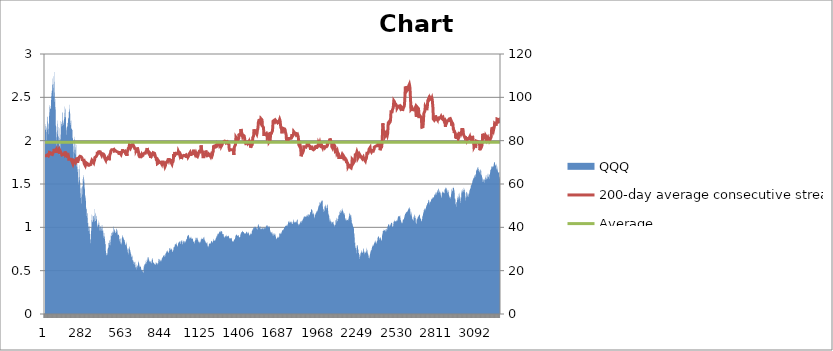
| Category | 200-day average consecutive streak | Average |
|---|---|---|
| 0 | 1.825 | 1.981 |
| 1 | 1.825 | 1.981 |
| 2 | 1.825 | 1.981 |
| 3 | 1.83 | 1.981 |
| 4 | 1.825 | 1.981 |
| 5 | 1.825 | 1.981 |
| 6 | 1.83 | 1.981 |
| 7 | 1.83 | 1.981 |
| 8 | 1.825 | 1.981 |
| 9 | 1.82 | 1.981 |
| 10 | 1.83 | 1.981 |
| 11 | 1.825 | 1.981 |
| 12 | 1.83 | 1.981 |
| 13 | 1.83 | 1.981 |
| 14 | 1.835 | 1.981 |
| 15 | 1.83 | 1.981 |
| 16 | 1.835 | 1.981 |
| 17 | 1.84 | 1.981 |
| 18 | 1.845 | 1.981 |
| 19 | 1.845 | 1.981 |
| 20 | 1.845 | 1.981 |
| 21 | 1.84 | 1.981 |
| 22 | 1.84 | 1.981 |
| 23 | 1.835 | 1.981 |
| 24 | 1.825 | 1.981 |
| 25 | 1.825 | 1.981 |
| 26 | 1.825 | 1.981 |
| 27 | 1.825 | 1.981 |
| 28 | 1.835 | 1.981 |
| 29 | 1.845 | 1.981 |
| 30 | 1.855 | 1.981 |
| 31 | 1.865 | 1.981 |
| 32 | 1.875 | 1.981 |
| 33 | 1.875 | 1.981 |
| 34 | 1.87 | 1.981 |
| 35 | 1.86 | 1.981 |
| 36 | 1.865 | 1.981 |
| 37 | 1.865 | 1.981 |
| 38 | 1.86 | 1.981 |
| 39 | 1.86 | 1.981 |
| 40 | 1.86 | 1.981 |
| 41 | 1.86 | 1.981 |
| 42 | 1.86 | 1.981 |
| 43 | 1.86 | 1.981 |
| 44 | 1.845 | 1.981 |
| 45 | 1.85 | 1.981 |
| 46 | 1.845 | 1.981 |
| 47 | 1.85 | 1.981 |
| 48 | 1.85 | 1.981 |
| 49 | 1.85 | 1.981 |
| 50 | 1.855 | 1.981 |
| 51 | 1.85 | 1.981 |
| 52 | 1.84 | 1.981 |
| 53 | 1.83 | 1.981 |
| 54 | 1.83 | 1.981 |
| 55 | 1.835 | 1.981 |
| 56 | 1.845 | 1.981 |
| 57 | 1.86 | 1.981 |
| 58 | 1.86 | 1.981 |
| 59 | 1.865 | 1.981 |
| 60 | 1.865 | 1.981 |
| 61 | 1.86 | 1.981 |
| 62 | 1.865 | 1.981 |
| 63 | 1.875 | 1.981 |
| 64 | 1.89 | 1.981 |
| 65 | 1.905 | 1.981 |
| 66 | 1.895 | 1.981 |
| 67 | 1.9 | 1.981 |
| 68 | 1.905 | 1.981 |
| 69 | 1.895 | 1.981 |
| 70 | 1.88 | 1.981 |
| 71 | 1.865 | 1.981 |
| 72 | 1.875 | 1.981 |
| 73 | 1.875 | 1.981 |
| 74 | 1.88 | 1.981 |
| 75 | 1.875 | 1.981 |
| 76 | 1.88 | 1.981 |
| 77 | 1.885 | 1.981 |
| 78 | 1.89 | 1.981 |
| 79 | 1.895 | 1.981 |
| 80 | 1.875 | 1.981 |
| 81 | 1.88 | 1.981 |
| 82 | 1.88 | 1.981 |
| 83 | 1.88 | 1.981 |
| 84 | 1.88 | 1.981 |
| 85 | 1.88 | 1.981 |
| 86 | 1.875 | 1.981 |
| 87 | 1.875 | 1.981 |
| 88 | 1.875 | 1.981 |
| 89 | 1.875 | 1.981 |
| 90 | 1.875 | 1.981 |
| 91 | 1.875 | 1.981 |
| 92 | 1.875 | 1.981 |
| 93 | 1.88 | 1.981 |
| 94 | 1.88 | 1.981 |
| 95 | 1.885 | 1.981 |
| 96 | 1.895 | 1.981 |
| 97 | 1.89 | 1.981 |
| 98 | 1.89 | 1.981 |
| 99 | 1.885 | 1.981 |
| 100 | 1.88 | 1.981 |
| 101 | 1.865 | 1.981 |
| 102 | 1.85 | 1.981 |
| 103 | 1.86 | 1.981 |
| 104 | 1.875 | 1.981 |
| 105 | 1.89 | 1.981 |
| 106 | 1.88 | 1.981 |
| 107 | 1.88 | 1.981 |
| 108 | 1.885 | 1.981 |
| 109 | 1.885 | 1.981 |
| 110 | 1.88 | 1.981 |
| 111 | 1.87 | 1.981 |
| 112 | 1.875 | 1.981 |
| 113 | 1.88 | 1.981 |
| 114 | 1.88 | 1.981 |
| 115 | 1.875 | 1.981 |
| 116 | 1.865 | 1.981 |
| 117 | 1.85 | 1.981 |
| 118 | 1.85 | 1.981 |
| 119 | 1.845 | 1.981 |
| 120 | 1.835 | 1.981 |
| 121 | 1.835 | 1.981 |
| 122 | 1.835 | 1.981 |
| 123 | 1.845 | 1.981 |
| 124 | 1.845 | 1.981 |
| 125 | 1.845 | 1.981 |
| 126 | 1.84 | 1.981 |
| 127 | 1.845 | 1.981 |
| 128 | 1.84 | 1.981 |
| 129 | 1.84 | 1.981 |
| 130 | 1.84 | 1.981 |
| 131 | 1.84 | 1.981 |
| 132 | 1.835 | 1.981 |
| 133 | 1.84 | 1.981 |
| 134 | 1.835 | 1.981 |
| 135 | 1.835 | 1.981 |
| 136 | 1.84 | 1.981 |
| 137 | 1.84 | 1.981 |
| 138 | 1.84 | 1.981 |
| 139 | 1.84 | 1.981 |
| 140 | 1.84 | 1.981 |
| 141 | 1.855 | 1.981 |
| 142 | 1.875 | 1.981 |
| 143 | 1.87 | 1.981 |
| 144 | 1.865 | 1.981 |
| 145 | 1.85 | 1.981 |
| 146 | 1.83 | 1.981 |
| 147 | 1.835 | 1.981 |
| 148 | 1.835 | 1.981 |
| 149 | 1.83 | 1.981 |
| 150 | 1.835 | 1.981 |
| 151 | 1.84 | 1.981 |
| 152 | 1.84 | 1.981 |
| 153 | 1.84 | 1.981 |
| 154 | 1.84 | 1.981 |
| 155 | 1.84 | 1.981 |
| 156 | 1.835 | 1.981 |
| 157 | 1.825 | 1.981 |
| 158 | 1.83 | 1.981 |
| 159 | 1.83 | 1.981 |
| 160 | 1.835 | 1.981 |
| 161 | 1.83 | 1.981 |
| 162 | 1.835 | 1.981 |
| 163 | 1.83 | 1.981 |
| 164 | 1.83 | 1.981 |
| 165 | 1.835 | 1.981 |
| 166 | 1.83 | 1.981 |
| 167 | 1.82 | 1.981 |
| 168 | 1.805 | 1.981 |
| 169 | 1.785 | 1.981 |
| 170 | 1.79 | 1.981 |
| 171 | 1.79 | 1.981 |
| 172 | 1.785 | 1.981 |
| 173 | 1.78 | 1.981 |
| 174 | 1.78 | 1.981 |
| 175 | 1.78 | 1.981 |
| 176 | 1.785 | 1.981 |
| 177 | 1.785 | 1.981 |
| 178 | 1.785 | 1.981 |
| 179 | 1.785 | 1.981 |
| 180 | 1.785 | 1.981 |
| 181 | 1.785 | 1.981 |
| 182 | 1.785 | 1.981 |
| 183 | 1.785 | 1.981 |
| 184 | 1.78 | 1.981 |
| 185 | 1.785 | 1.981 |
| 186 | 1.79 | 1.981 |
| 187 | 1.78 | 1.981 |
| 188 | 1.77 | 1.981 |
| 189 | 1.77 | 1.981 |
| 190 | 1.765 | 1.981 |
| 191 | 1.765 | 1.981 |
| 192 | 1.765 | 1.981 |
| 193 | 1.755 | 1.981 |
| 194 | 1.76 | 1.981 |
| 195 | 1.76 | 1.981 |
| 196 | 1.76 | 1.981 |
| 197 | 1.76 | 1.981 |
| 198 | 1.745 | 1.981 |
| 199 | 1.73 | 1.981 |
| 200 | 1.73 | 1.981 |
| 201 | 1.735 | 1.981 |
| 202 | 1.745 | 1.981 |
| 203 | 1.755 | 1.981 |
| 204 | 1.775 | 1.981 |
| 205 | 1.775 | 1.981 |
| 206 | 1.775 | 1.981 |
| 207 | 1.775 | 1.981 |
| 208 | 1.78 | 1.981 |
| 209 | 1.775 | 1.981 |
| 210 | 1.77 | 1.981 |
| 211 | 1.77 | 1.981 |
| 212 | 1.77 | 1.981 |
| 213 | 1.78 | 1.981 |
| 214 | 1.775 | 1.981 |
| 215 | 1.775 | 1.981 |
| 216 | 1.775 | 1.981 |
| 217 | 1.765 | 1.981 |
| 218 | 1.75 | 1.981 |
| 219 | 1.75 | 1.981 |
| 220 | 1.755 | 1.981 |
| 221 | 1.755 | 1.981 |
| 222 | 1.76 | 1.981 |
| 223 | 1.77 | 1.981 |
| 224 | 1.785 | 1.981 |
| 225 | 1.805 | 1.981 |
| 226 | 1.805 | 1.981 |
| 227 | 1.805 | 1.981 |
| 228 | 1.805 | 1.981 |
| 229 | 1.79 | 1.981 |
| 230 | 1.775 | 1.981 |
| 231 | 1.76 | 1.981 |
| 232 | 1.745 | 1.981 |
| 233 | 1.765 | 1.981 |
| 234 | 1.765 | 1.981 |
| 235 | 1.765 | 1.981 |
| 236 | 1.765 | 1.981 |
| 237 | 1.775 | 1.981 |
| 238 | 1.775 | 1.981 |
| 239 | 1.78 | 1.981 |
| 240 | 1.79 | 1.981 |
| 241 | 1.805 | 1.981 |
| 242 | 1.8 | 1.981 |
| 243 | 1.795 | 1.981 |
| 244 | 1.795 | 1.981 |
| 245 | 1.795 | 1.981 |
| 246 | 1.795 | 1.981 |
| 247 | 1.795 | 1.981 |
| 248 | 1.805 | 1.981 |
| 249 | 1.82 | 1.981 |
| 250 | 1.815 | 1.981 |
| 251 | 1.815 | 1.981 |
| 252 | 1.82 | 1.981 |
| 253 | 1.815 | 1.981 |
| 254 | 1.82 | 1.981 |
| 255 | 1.825 | 1.981 |
| 256 | 1.83 | 1.981 |
| 257 | 1.815 | 1.981 |
| 258 | 1.82 | 1.981 |
| 259 | 1.825 | 1.981 |
| 260 | 1.825 | 1.981 |
| 261 | 1.825 | 1.981 |
| 262 | 1.825 | 1.981 |
| 263 | 1.815 | 1.981 |
| 264 | 1.8 | 1.981 |
| 265 | 1.78 | 1.981 |
| 266 | 1.785 | 1.981 |
| 267 | 1.79 | 1.981 |
| 268 | 1.78 | 1.981 |
| 269 | 1.78 | 1.981 |
| 270 | 1.785 | 1.981 |
| 271 | 1.78 | 1.981 |
| 272 | 1.77 | 1.981 |
| 273 | 1.775 | 1.981 |
| 274 | 1.77 | 1.981 |
| 275 | 1.775 | 1.981 |
| 276 | 1.77 | 1.981 |
| 277 | 1.765 | 1.981 |
| 278 | 1.75 | 1.981 |
| 279 | 1.735 | 1.981 |
| 280 | 1.735 | 1.981 |
| 281 | 1.73 | 1.981 |
| 282 | 1.735 | 1.981 |
| 283 | 1.73 | 1.981 |
| 284 | 1.72 | 1.981 |
| 285 | 1.725 | 1.981 |
| 286 | 1.735 | 1.981 |
| 287 | 1.735 | 1.981 |
| 288 | 1.73 | 1.981 |
| 289 | 1.72 | 1.981 |
| 290 | 1.725 | 1.981 |
| 291 | 1.72 | 1.981 |
| 292 | 1.725 | 1.981 |
| 293 | 1.73 | 1.981 |
| 294 | 1.745 | 1.981 |
| 295 | 1.74 | 1.981 |
| 296 | 1.735 | 1.981 |
| 297 | 1.735 | 1.981 |
| 298 | 1.74 | 1.981 |
| 299 | 1.74 | 1.981 |
| 300 | 1.735 | 1.981 |
| 301 | 1.735 | 1.981 |
| 302 | 1.735 | 1.981 |
| 303 | 1.735 | 1.981 |
| 304 | 1.72 | 1.981 |
| 305 | 1.705 | 1.981 |
| 306 | 1.715 | 1.981 |
| 307 | 1.715 | 1.981 |
| 308 | 1.71 | 1.981 |
| 309 | 1.715 | 1.981 |
| 310 | 1.725 | 1.981 |
| 311 | 1.725 | 1.981 |
| 312 | 1.72 | 1.981 |
| 313 | 1.715 | 1.981 |
| 314 | 1.715 | 1.981 |
| 315 | 1.715 | 1.981 |
| 316 | 1.72 | 1.981 |
| 317 | 1.72 | 1.981 |
| 318 | 1.72 | 1.981 |
| 319 | 1.725 | 1.981 |
| 320 | 1.725 | 1.981 |
| 321 | 1.725 | 1.981 |
| 322 | 1.725 | 1.981 |
| 323 | 1.725 | 1.981 |
| 324 | 1.725 | 1.981 |
| 325 | 1.725 | 1.981 |
| 326 | 1.725 | 1.981 |
| 327 | 1.725 | 1.981 |
| 328 | 1.735 | 1.981 |
| 329 | 1.75 | 1.981 |
| 330 | 1.75 | 1.981 |
| 331 | 1.75 | 1.981 |
| 332 | 1.755 | 1.981 |
| 333 | 1.76 | 1.981 |
| 334 | 1.775 | 1.981 |
| 335 | 1.775 | 1.981 |
| 336 | 1.775 | 1.981 |
| 337 | 1.775 | 1.981 |
| 338 | 1.775 | 1.981 |
| 339 | 1.77 | 1.981 |
| 340 | 1.765 | 1.981 |
| 341 | 1.76 | 1.981 |
| 342 | 1.755 | 1.981 |
| 343 | 1.755 | 1.981 |
| 344 | 1.75 | 1.981 |
| 345 | 1.75 | 1.981 |
| 346 | 1.75 | 1.981 |
| 347 | 1.745 | 1.981 |
| 348 | 1.75 | 1.981 |
| 349 | 1.76 | 1.981 |
| 350 | 1.77 | 1.981 |
| 351 | 1.76 | 1.981 |
| 352 | 1.765 | 1.981 |
| 353 | 1.775 | 1.981 |
| 354 | 1.785 | 1.981 |
| 355 | 1.805 | 1.981 |
| 356 | 1.805 | 1.981 |
| 357 | 1.81 | 1.981 |
| 358 | 1.805 | 1.981 |
| 359 | 1.805 | 1.981 |
| 360 | 1.805 | 1.981 |
| 361 | 1.815 | 1.981 |
| 362 | 1.81 | 1.981 |
| 363 | 1.815 | 1.981 |
| 364 | 1.815 | 1.981 |
| 365 | 1.81 | 1.981 |
| 366 | 1.81 | 1.981 |
| 367 | 1.81 | 1.981 |
| 368 | 1.81 | 1.981 |
| 369 | 1.815 | 1.981 |
| 370 | 1.82 | 1.981 |
| 371 | 1.835 | 1.981 |
| 372 | 1.855 | 1.981 |
| 373 | 1.85 | 1.981 |
| 374 | 1.85 | 1.981 |
| 375 | 1.855 | 1.981 |
| 376 | 1.85 | 1.981 |
| 377 | 1.855 | 1.981 |
| 378 | 1.85 | 1.981 |
| 379 | 1.85 | 1.981 |
| 380 | 1.855 | 1.981 |
| 381 | 1.86 | 1.981 |
| 382 | 1.865 | 1.981 |
| 383 | 1.885 | 1.981 |
| 384 | 1.885 | 1.981 |
| 385 | 1.88 | 1.981 |
| 386 | 1.87 | 1.981 |
| 387 | 1.875 | 1.981 |
| 388 | 1.87 | 1.981 |
| 389 | 1.87 | 1.981 |
| 390 | 1.87 | 1.981 |
| 391 | 1.875 | 1.981 |
| 392 | 1.87 | 1.981 |
| 393 | 1.875 | 1.981 |
| 394 | 1.87 | 1.981 |
| 395 | 1.87 | 1.981 |
| 396 | 1.865 | 1.981 |
| 397 | 1.855 | 1.981 |
| 398 | 1.86 | 1.981 |
| 399 | 1.865 | 1.981 |
| 400 | 1.865 | 1.981 |
| 401 | 1.865 | 1.981 |
| 402 | 1.865 | 1.981 |
| 403 | 1.85 | 1.981 |
| 404 | 1.83 | 1.981 |
| 405 | 1.835 | 1.981 |
| 406 | 1.84 | 1.981 |
| 407 | 1.84 | 1.981 |
| 408 | 1.84 | 1.981 |
| 409 | 1.85 | 1.981 |
| 410 | 1.86 | 1.981 |
| 411 | 1.86 | 1.981 |
| 412 | 1.855 | 1.981 |
| 413 | 1.845 | 1.981 |
| 414 | 1.845 | 1.981 |
| 415 | 1.85 | 1.981 |
| 416 | 1.845 | 1.981 |
| 417 | 1.845 | 1.981 |
| 418 | 1.845 | 1.981 |
| 419 | 1.845 | 1.981 |
| 420 | 1.84 | 1.981 |
| 421 | 1.84 | 1.981 |
| 422 | 1.835 | 1.981 |
| 423 | 1.83 | 1.981 |
| 424 | 1.815 | 1.981 |
| 425 | 1.8 | 1.981 |
| 426 | 1.81 | 1.981 |
| 427 | 1.805 | 1.981 |
| 428 | 1.795 | 1.981 |
| 429 | 1.8 | 1.981 |
| 430 | 1.805 | 1.981 |
| 431 | 1.81 | 1.981 |
| 432 | 1.795 | 1.981 |
| 433 | 1.775 | 1.981 |
| 434 | 1.78 | 1.981 |
| 435 | 1.79 | 1.981 |
| 436 | 1.8 | 1.981 |
| 437 | 1.81 | 1.981 |
| 438 | 1.81 | 1.981 |
| 439 | 1.81 | 1.981 |
| 440 | 1.8 | 1.981 |
| 441 | 1.79 | 1.981 |
| 442 | 1.79 | 1.981 |
| 443 | 1.785 | 1.981 |
| 444 | 1.785 | 1.981 |
| 445 | 1.785 | 1.981 |
| 446 | 1.795 | 1.981 |
| 447 | 1.805 | 1.981 |
| 448 | 1.815 | 1.981 |
| 449 | 1.8 | 1.981 |
| 450 | 1.8 | 1.981 |
| 451 | 1.805 | 1.981 |
| 452 | 1.8 | 1.981 |
| 453 | 1.805 | 1.981 |
| 454 | 1.8 | 1.981 |
| 455 | 1.79 | 1.981 |
| 456 | 1.775 | 1.981 |
| 457 | 1.78 | 1.981 |
| 458 | 1.785 | 1.981 |
| 459 | 1.79 | 1.981 |
| 460 | 1.81 | 1.981 |
| 461 | 1.835 | 1.981 |
| 462 | 1.83 | 1.981 |
| 463 | 1.835 | 1.981 |
| 464 | 1.845 | 1.981 |
| 465 | 1.845 | 1.981 |
| 466 | 1.845 | 1.981 |
| 467 | 1.845 | 1.981 |
| 468 | 1.86 | 1.981 |
| 469 | 1.88 | 1.981 |
| 470 | 1.875 | 1.981 |
| 471 | 1.88 | 1.981 |
| 472 | 1.89 | 1.981 |
| 473 | 1.885 | 1.981 |
| 474 | 1.89 | 1.981 |
| 475 | 1.895 | 1.981 |
| 476 | 1.895 | 1.981 |
| 477 | 1.895 | 1.981 |
| 478 | 1.895 | 1.981 |
| 479 | 1.89 | 1.981 |
| 480 | 1.895 | 1.981 |
| 481 | 1.895 | 1.981 |
| 482 | 1.895 | 1.981 |
| 483 | 1.895 | 1.981 |
| 484 | 1.9 | 1.981 |
| 485 | 1.895 | 1.981 |
| 486 | 1.885 | 1.981 |
| 487 | 1.89 | 1.981 |
| 488 | 1.89 | 1.981 |
| 489 | 1.895 | 1.981 |
| 490 | 1.9 | 1.981 |
| 491 | 1.9 | 1.981 |
| 492 | 1.9 | 1.981 |
| 493 | 1.89 | 1.981 |
| 494 | 1.88 | 1.981 |
| 495 | 1.88 | 1.981 |
| 496 | 1.875 | 1.981 |
| 497 | 1.88 | 1.981 |
| 498 | 1.885 | 1.981 |
| 499 | 1.885 | 1.981 |
| 500 | 1.89 | 1.981 |
| 501 | 1.89 | 1.981 |
| 502 | 1.885 | 1.981 |
| 503 | 1.875 | 1.981 |
| 504 | 1.88 | 1.981 |
| 505 | 1.885 | 1.981 |
| 506 | 1.875 | 1.981 |
| 507 | 1.875 | 1.981 |
| 508 | 1.88 | 1.981 |
| 509 | 1.885 | 1.981 |
| 510 | 1.875 | 1.981 |
| 511 | 1.875 | 1.981 |
| 512 | 1.875 | 1.981 |
| 513 | 1.87 | 1.981 |
| 514 | 1.87 | 1.981 |
| 515 | 1.875 | 1.981 |
| 516 | 1.87 | 1.981 |
| 517 | 1.87 | 1.981 |
| 518 | 1.87 | 1.981 |
| 519 | 1.865 | 1.981 |
| 520 | 1.87 | 1.981 |
| 521 | 1.87 | 1.981 |
| 522 | 1.87 | 1.981 |
| 523 | 1.86 | 1.981 |
| 524 | 1.86 | 1.981 |
| 525 | 1.86 | 1.981 |
| 526 | 1.86 | 1.981 |
| 527 | 1.86 | 1.981 |
| 528 | 1.85 | 1.981 |
| 529 | 1.84 | 1.981 |
| 530 | 1.85 | 1.981 |
| 531 | 1.865 | 1.981 |
| 532 | 1.88 | 1.981 |
| 533 | 1.87 | 1.981 |
| 534 | 1.86 | 1.981 |
| 535 | 1.86 | 1.981 |
| 536 | 1.855 | 1.981 |
| 537 | 1.855 | 1.981 |
| 538 | 1.86 | 1.981 |
| 539 | 1.87 | 1.981 |
| 540 | 1.865 | 1.981 |
| 541 | 1.855 | 1.981 |
| 542 | 1.84 | 1.981 |
| 543 | 1.845 | 1.981 |
| 544 | 1.845 | 1.981 |
| 545 | 1.85 | 1.981 |
| 546 | 1.86 | 1.981 |
| 547 | 1.86 | 1.981 |
| 548 | 1.86 | 1.981 |
| 549 | 1.86 | 1.981 |
| 550 | 1.86 | 1.981 |
| 551 | 1.88 | 1.981 |
| 552 | 1.9 | 1.981 |
| 553 | 1.89 | 1.981 |
| 554 | 1.88 | 1.981 |
| 555 | 1.87 | 1.981 |
| 556 | 1.885 | 1.981 |
| 557 | 1.88 | 1.981 |
| 558 | 1.885 | 1.981 |
| 559 | 1.885 | 1.981 |
| 560 | 1.885 | 1.981 |
| 561 | 1.875 | 1.981 |
| 562 | 1.875 | 1.981 |
| 563 | 1.875 | 1.981 |
| 564 | 1.875 | 1.981 |
| 565 | 1.875 | 1.981 |
| 566 | 1.875 | 1.981 |
| 567 | 1.88 | 1.981 |
| 568 | 1.88 | 1.981 |
| 569 | 1.88 | 1.981 |
| 570 | 1.88 | 1.981 |
| 571 | 1.88 | 1.981 |
| 572 | 1.86 | 1.981 |
| 573 | 1.86 | 1.981 |
| 574 | 1.86 | 1.981 |
| 575 | 1.855 | 1.981 |
| 576 | 1.855 | 1.981 |
| 577 | 1.855 | 1.981 |
| 578 | 1.865 | 1.981 |
| 579 | 1.865 | 1.981 |
| 580 | 1.865 | 1.981 |
| 581 | 1.855 | 1.981 |
| 582 | 1.84 | 1.981 |
| 583 | 1.825 | 1.981 |
| 584 | 1.835 | 1.981 |
| 585 | 1.85 | 1.981 |
| 586 | 1.87 | 1.981 |
| 587 | 1.865 | 1.981 |
| 588 | 1.87 | 1.981 |
| 589 | 1.87 | 1.981 |
| 590 | 1.875 | 1.981 |
| 591 | 1.88 | 1.981 |
| 592 | 1.895 | 1.981 |
| 593 | 1.91 | 1.981 |
| 594 | 1.91 | 1.981 |
| 595 | 1.91 | 1.981 |
| 596 | 1.915 | 1.981 |
| 597 | 1.915 | 1.981 |
| 598 | 1.915 | 1.981 |
| 599 | 1.915 | 1.981 |
| 600 | 1.93 | 1.981 |
| 601 | 1.945 | 1.981 |
| 602 | 1.935 | 1.981 |
| 603 | 1.94 | 1.981 |
| 604 | 1.94 | 1.981 |
| 605 | 1.94 | 1.981 |
| 606 | 1.93 | 1.981 |
| 607 | 1.935 | 1.981 |
| 608 | 1.94 | 1.981 |
| 609 | 1.93 | 1.981 |
| 610 | 1.915 | 1.981 |
| 611 | 1.92 | 1.981 |
| 612 | 1.92 | 1.981 |
| 613 | 1.925 | 1.981 |
| 614 | 1.925 | 1.981 |
| 615 | 1.925 | 1.981 |
| 616 | 1.935 | 1.981 |
| 617 | 1.95 | 1.981 |
| 618 | 1.95 | 1.981 |
| 619 | 1.95 | 1.981 |
| 620 | 1.955 | 1.981 |
| 621 | 1.955 | 1.981 |
| 622 | 1.96 | 1.981 |
| 623 | 1.955 | 1.981 |
| 624 | 1.96 | 1.981 |
| 625 | 1.965 | 1.981 |
| 626 | 1.955 | 1.981 |
| 627 | 1.955 | 1.981 |
| 628 | 1.955 | 1.981 |
| 629 | 1.955 | 1.981 |
| 630 | 1.945 | 1.981 |
| 631 | 1.935 | 1.981 |
| 632 | 1.945 | 1.981 |
| 633 | 1.945 | 1.981 |
| 634 | 1.945 | 1.981 |
| 635 | 1.935 | 1.981 |
| 636 | 1.925 | 1.981 |
| 637 | 1.915 | 1.981 |
| 638 | 1.915 | 1.981 |
| 639 | 1.91 | 1.981 |
| 640 | 1.91 | 1.981 |
| 641 | 1.905 | 1.981 |
| 642 | 1.905 | 1.981 |
| 643 | 1.905 | 1.981 |
| 644 | 1.91 | 1.981 |
| 645 | 1.915 | 1.981 |
| 646 | 1.92 | 1.981 |
| 647 | 1.905 | 1.981 |
| 648 | 1.885 | 1.981 |
| 649 | 1.885 | 1.981 |
| 650 | 1.89 | 1.981 |
| 651 | 1.895 | 1.981 |
| 652 | 1.895 | 1.981 |
| 653 | 1.895 | 1.981 |
| 654 | 1.905 | 1.981 |
| 655 | 1.92 | 1.981 |
| 656 | 1.92 | 1.981 |
| 657 | 1.92 | 1.981 |
| 658 | 1.92 | 1.981 |
| 659 | 1.905 | 1.981 |
| 660 | 1.885 | 1.981 |
| 661 | 1.86 | 1.981 |
| 662 | 1.86 | 1.981 |
| 663 | 1.86 | 1.981 |
| 664 | 1.86 | 1.981 |
| 665 | 1.875 | 1.981 |
| 666 | 1.87 | 1.981 |
| 667 | 1.86 | 1.981 |
| 668 | 1.85 | 1.981 |
| 669 | 1.83 | 1.981 |
| 670 | 1.83 | 1.981 |
| 671 | 1.825 | 1.981 |
| 672 | 1.82 | 1.981 |
| 673 | 1.82 | 1.981 |
| 674 | 1.815 | 1.981 |
| 675 | 1.81 | 1.981 |
| 676 | 1.81 | 1.981 |
| 677 | 1.805 | 1.981 |
| 678 | 1.805 | 1.981 |
| 679 | 1.81 | 1.981 |
| 680 | 1.815 | 1.981 |
| 681 | 1.815 | 1.981 |
| 682 | 1.815 | 1.981 |
| 683 | 1.815 | 1.981 |
| 684 | 1.81 | 1.981 |
| 685 | 1.815 | 1.981 |
| 686 | 1.825 | 1.981 |
| 687 | 1.835 | 1.981 |
| 688 | 1.835 | 1.981 |
| 689 | 1.83 | 1.981 |
| 690 | 1.82 | 1.981 |
| 691 | 1.825 | 1.981 |
| 692 | 1.82 | 1.981 |
| 693 | 1.825 | 1.981 |
| 694 | 1.83 | 1.981 |
| 695 | 1.83 | 1.981 |
| 696 | 1.83 | 1.981 |
| 697 | 1.83 | 1.981 |
| 698 | 1.83 | 1.981 |
| 699 | 1.845 | 1.981 |
| 700 | 1.84 | 1.981 |
| 701 | 1.84 | 1.981 |
| 702 | 1.84 | 1.981 |
| 703 | 1.845 | 1.981 |
| 704 | 1.85 | 1.981 |
| 705 | 1.855 | 1.981 |
| 706 | 1.855 | 1.981 |
| 707 | 1.855 | 1.981 |
| 708 | 1.855 | 1.981 |
| 709 | 1.855 | 1.981 |
| 710 | 1.855 | 1.981 |
| 711 | 1.855 | 1.981 |
| 712 | 1.855 | 1.981 |
| 713 | 1.855 | 1.981 |
| 714 | 1.855 | 1.981 |
| 715 | 1.855 | 1.981 |
| 716 | 1.855 | 1.981 |
| 717 | 1.855 | 1.981 |
| 718 | 1.855 | 1.981 |
| 719 | 1.86 | 1.981 |
| 720 | 1.865 | 1.981 |
| 721 | 1.88 | 1.981 |
| 722 | 1.875 | 1.981 |
| 723 | 1.88 | 1.981 |
| 724 | 1.89 | 1.981 |
| 725 | 1.89 | 1.981 |
| 726 | 1.895 | 1.981 |
| 727 | 1.9 | 1.981 |
| 728 | 1.915 | 1.981 |
| 729 | 1.91 | 1.981 |
| 730 | 1.905 | 1.981 |
| 731 | 1.89 | 1.981 |
| 732 | 1.875 | 1.981 |
| 733 | 1.875 | 1.981 |
| 734 | 1.87 | 1.981 |
| 735 | 1.87 | 1.981 |
| 736 | 1.87 | 1.981 |
| 737 | 1.87 | 1.981 |
| 738 | 1.865 | 1.981 |
| 739 | 1.855 | 1.981 |
| 740 | 1.86 | 1.981 |
| 741 | 1.87 | 1.981 |
| 742 | 1.87 | 1.981 |
| 743 | 1.865 | 1.981 |
| 744 | 1.865 | 1.981 |
| 745 | 1.865 | 1.981 |
| 746 | 1.865 | 1.981 |
| 747 | 1.865 | 1.981 |
| 748 | 1.86 | 1.981 |
| 749 | 1.855 | 1.981 |
| 750 | 1.84 | 1.981 |
| 751 | 1.825 | 1.981 |
| 752 | 1.8 | 1.981 |
| 753 | 1.805 | 1.981 |
| 754 | 1.8 | 1.981 |
| 755 | 1.795 | 1.981 |
| 756 | 1.79 | 1.981 |
| 757 | 1.805 | 1.981 |
| 758 | 1.82 | 1.981 |
| 759 | 1.82 | 1.981 |
| 760 | 1.82 | 1.981 |
| 761 | 1.83 | 1.981 |
| 762 | 1.845 | 1.981 |
| 763 | 1.84 | 1.981 |
| 764 | 1.84 | 1.981 |
| 765 | 1.845 | 1.981 |
| 766 | 1.845 | 1.981 |
| 767 | 1.84 | 1.981 |
| 768 | 1.84 | 1.981 |
| 769 | 1.84 | 1.981 |
| 770 | 1.84 | 1.981 |
| 771 | 1.84 | 1.981 |
| 772 | 1.86 | 1.981 |
| 773 | 1.86 | 1.981 |
| 774 | 1.86 | 1.981 |
| 775 | 1.865 | 1.981 |
| 776 | 1.865 | 1.981 |
| 777 | 1.865 | 1.981 |
| 778 | 1.855 | 1.981 |
| 779 | 1.86 | 1.981 |
| 780 | 1.855 | 1.981 |
| 781 | 1.855 | 1.981 |
| 782 | 1.86 | 1.981 |
| 783 | 1.855 | 1.981 |
| 784 | 1.845 | 1.981 |
| 785 | 1.83 | 1.981 |
| 786 | 1.815 | 1.981 |
| 787 | 1.815 | 1.981 |
| 788 | 1.81 | 1.981 |
| 789 | 1.815 | 1.981 |
| 790 | 1.82 | 1.981 |
| 791 | 1.81 | 1.981 |
| 792 | 1.8 | 1.981 |
| 793 | 1.78 | 1.981 |
| 794 | 1.78 | 1.981 |
| 795 | 1.78 | 1.981 |
| 796 | 1.775 | 1.981 |
| 797 | 1.775 | 1.981 |
| 798 | 1.775 | 1.981 |
| 799 | 1.765 | 1.981 |
| 800 | 1.755 | 1.981 |
| 801 | 1.735 | 1.981 |
| 802 | 1.735 | 1.981 |
| 803 | 1.73 | 1.981 |
| 804 | 1.73 | 1.981 |
| 805 | 1.73 | 1.981 |
| 806 | 1.73 | 1.981 |
| 807 | 1.73 | 1.981 |
| 808 | 1.73 | 1.981 |
| 809 | 1.745 | 1.981 |
| 810 | 1.765 | 1.981 |
| 811 | 1.76 | 1.981 |
| 812 | 1.76 | 1.981 |
| 813 | 1.76 | 1.981 |
| 814 | 1.76 | 1.981 |
| 815 | 1.755 | 1.981 |
| 816 | 1.75 | 1.981 |
| 817 | 1.735 | 1.981 |
| 818 | 1.74 | 1.981 |
| 819 | 1.75 | 1.981 |
| 820 | 1.745 | 1.981 |
| 821 | 1.75 | 1.981 |
| 822 | 1.755 | 1.981 |
| 823 | 1.755 | 1.981 |
| 824 | 1.75 | 1.981 |
| 825 | 1.74 | 1.981 |
| 826 | 1.745 | 1.981 |
| 827 | 1.745 | 1.981 |
| 828 | 1.745 | 1.981 |
| 829 | 1.74 | 1.981 |
| 830 | 1.745 | 1.981 |
| 831 | 1.74 | 1.981 |
| 832 | 1.73 | 1.981 |
| 833 | 1.735 | 1.981 |
| 834 | 1.74 | 1.981 |
| 835 | 1.755 | 1.981 |
| 836 | 1.75 | 1.981 |
| 837 | 1.745 | 1.981 |
| 838 | 1.745 | 1.981 |
| 839 | 1.75 | 1.981 |
| 840 | 1.75 | 1.981 |
| 841 | 1.75 | 1.981 |
| 842 | 1.755 | 1.981 |
| 843 | 1.755 | 1.981 |
| 844 | 1.75 | 1.981 |
| 845 | 1.74 | 1.981 |
| 846 | 1.73 | 1.981 |
| 847 | 1.73 | 1.981 |
| 848 | 1.735 | 1.981 |
| 849 | 1.735 | 1.981 |
| 850 | 1.735 | 1.981 |
| 851 | 1.725 | 1.981 |
| 852 | 1.725 | 1.981 |
| 853 | 1.725 | 1.981 |
| 854 | 1.715 | 1.981 |
| 855 | 1.7 | 1.981 |
| 856 | 1.7 | 1.981 |
| 857 | 1.7 | 1.981 |
| 858 | 1.7 | 1.981 |
| 859 | 1.715 | 1.981 |
| 860 | 1.735 | 1.981 |
| 861 | 1.76 | 1.981 |
| 862 | 1.76 | 1.981 |
| 863 | 1.755 | 1.981 |
| 864 | 1.75 | 1.981 |
| 865 | 1.745 | 1.981 |
| 866 | 1.745 | 1.981 |
| 867 | 1.75 | 1.981 |
| 868 | 1.745 | 1.981 |
| 869 | 1.75 | 1.981 |
| 870 | 1.76 | 1.981 |
| 871 | 1.76 | 1.981 |
| 872 | 1.755 | 1.981 |
| 873 | 1.755 | 1.981 |
| 874 | 1.755 | 1.981 |
| 875 | 1.75 | 1.981 |
| 876 | 1.755 | 1.981 |
| 877 | 1.765 | 1.981 |
| 878 | 1.78 | 1.981 |
| 879 | 1.795 | 1.981 |
| 880 | 1.785 | 1.981 |
| 881 | 1.785 | 1.981 |
| 882 | 1.78 | 1.981 |
| 883 | 1.785 | 1.981 |
| 884 | 1.795 | 1.981 |
| 885 | 1.79 | 1.981 |
| 886 | 1.78 | 1.981 |
| 887 | 1.77 | 1.981 |
| 888 | 1.77 | 1.981 |
| 889 | 1.775 | 1.981 |
| 890 | 1.775 | 1.981 |
| 891 | 1.775 | 1.981 |
| 892 | 1.785 | 1.981 |
| 893 | 1.78 | 1.981 |
| 894 | 1.775 | 1.981 |
| 895 | 1.775 | 1.981 |
| 896 | 1.775 | 1.981 |
| 897 | 1.77 | 1.981 |
| 898 | 1.765 | 1.981 |
| 899 | 1.75 | 1.981 |
| 900 | 1.75 | 1.981 |
| 901 | 1.755 | 1.981 |
| 902 | 1.755 | 1.981 |
| 903 | 1.755 | 1.981 |
| 904 | 1.745 | 1.981 |
| 905 | 1.73 | 1.981 |
| 906 | 1.735 | 1.981 |
| 907 | 1.745 | 1.981 |
| 908 | 1.755 | 1.981 |
| 909 | 1.745 | 1.981 |
| 910 | 1.745 | 1.981 |
| 911 | 1.745 | 1.981 |
| 912 | 1.75 | 1.981 |
| 913 | 1.76 | 1.981 |
| 914 | 1.775 | 1.981 |
| 915 | 1.79 | 1.981 |
| 916 | 1.815 | 1.981 |
| 917 | 1.845 | 1.981 |
| 918 | 1.845 | 1.981 |
| 919 | 1.84 | 1.981 |
| 920 | 1.83 | 1.981 |
| 921 | 1.815 | 1.981 |
| 922 | 1.82 | 1.981 |
| 923 | 1.825 | 1.981 |
| 924 | 1.83 | 1.981 |
| 925 | 1.85 | 1.981 |
| 926 | 1.87 | 1.981 |
| 927 | 1.86 | 1.981 |
| 928 | 1.845 | 1.981 |
| 929 | 1.845 | 1.981 |
| 930 | 1.84 | 1.981 |
| 931 | 1.84 | 1.981 |
| 932 | 1.84 | 1.981 |
| 933 | 1.84 | 1.981 |
| 934 | 1.845 | 1.981 |
| 935 | 1.845 | 1.981 |
| 936 | 1.845 | 1.981 |
| 937 | 1.845 | 1.981 |
| 938 | 1.845 | 1.981 |
| 939 | 1.845 | 1.981 |
| 940 | 1.845 | 1.981 |
| 941 | 1.835 | 1.981 |
| 942 | 1.835 | 1.981 |
| 943 | 1.84 | 1.981 |
| 944 | 1.85 | 1.981 |
| 945 | 1.845 | 1.981 |
| 946 | 1.835 | 1.981 |
| 947 | 1.835 | 1.981 |
| 948 | 1.84 | 1.981 |
| 949 | 1.845 | 1.981 |
| 950 | 1.86 | 1.981 |
| 951 | 1.875 | 1.981 |
| 952 | 1.875 | 1.981 |
| 953 | 1.87 | 1.981 |
| 954 | 1.875 | 1.981 |
| 955 | 1.88 | 1.981 |
| 956 | 1.885 | 1.981 |
| 957 | 1.87 | 1.981 |
| 958 | 1.85 | 1.981 |
| 959 | 1.85 | 1.981 |
| 960 | 1.845 | 1.981 |
| 961 | 1.84 | 1.981 |
| 962 | 1.825 | 1.981 |
| 963 | 1.83 | 1.981 |
| 964 | 1.83 | 1.981 |
| 965 | 1.83 | 1.981 |
| 966 | 1.84 | 1.981 |
| 967 | 1.84 | 1.981 |
| 968 | 1.84 | 1.981 |
| 969 | 1.835 | 1.981 |
| 970 | 1.825 | 1.981 |
| 971 | 1.81 | 1.981 |
| 972 | 1.79 | 1.981 |
| 973 | 1.795 | 1.981 |
| 974 | 1.795 | 1.981 |
| 975 | 1.795 | 1.981 |
| 976 | 1.805 | 1.981 |
| 977 | 1.8 | 1.981 |
| 978 | 1.8 | 1.981 |
| 979 | 1.8 | 1.981 |
| 980 | 1.81 | 1.981 |
| 981 | 1.825 | 1.981 |
| 982 | 1.82 | 1.981 |
| 983 | 1.82 | 1.981 |
| 984 | 1.82 | 1.981 |
| 985 | 1.825 | 1.981 |
| 986 | 1.82 | 1.981 |
| 987 | 1.82 | 1.981 |
| 988 | 1.825 | 1.981 |
| 989 | 1.83 | 1.981 |
| 990 | 1.82 | 1.981 |
| 991 | 1.825 | 1.981 |
| 992 | 1.82 | 1.981 |
| 993 | 1.82 | 1.981 |
| 994 | 1.82 | 1.981 |
| 995 | 1.82 | 1.981 |
| 996 | 1.82 | 1.981 |
| 997 | 1.825 | 1.981 |
| 998 | 1.82 | 1.981 |
| 999 | 1.825 | 1.981 |
| 1000 | 1.82 | 1.981 |
| 1001 | 1.825 | 1.981 |
| 1002 | 1.835 | 1.981 |
| 1003 | 1.835 | 1.981 |
| 1004 | 1.835 | 1.981 |
| 1005 | 1.835 | 1.981 |
| 1006 | 1.845 | 1.981 |
| 1007 | 1.84 | 1.981 |
| 1008 | 1.83 | 1.981 |
| 1009 | 1.82 | 1.981 |
| 1010 | 1.8 | 1.981 |
| 1011 | 1.805 | 1.981 |
| 1012 | 1.805 | 1.981 |
| 1013 | 1.805 | 1.981 |
| 1014 | 1.815 | 1.981 |
| 1015 | 1.83 | 1.981 |
| 1016 | 1.825 | 1.981 |
| 1017 | 1.825 | 1.981 |
| 1018 | 1.82 | 1.981 |
| 1019 | 1.81 | 1.981 |
| 1020 | 1.815 | 1.981 |
| 1021 | 1.82 | 1.981 |
| 1022 | 1.81 | 1.981 |
| 1023 | 1.815 | 1.981 |
| 1024 | 1.825 | 1.981 |
| 1025 | 1.84 | 1.981 |
| 1026 | 1.835 | 1.981 |
| 1027 | 1.835 | 1.981 |
| 1028 | 1.84 | 1.981 |
| 1029 | 1.84 | 1.981 |
| 1030 | 1.835 | 1.981 |
| 1031 | 1.84 | 1.981 |
| 1032 | 1.85 | 1.981 |
| 1033 | 1.86 | 1.981 |
| 1034 | 1.85 | 1.981 |
| 1035 | 1.84 | 1.981 |
| 1036 | 1.84 | 1.981 |
| 1037 | 1.835 | 1.981 |
| 1038 | 1.84 | 1.981 |
| 1039 | 1.835 | 1.981 |
| 1040 | 1.84 | 1.981 |
| 1041 | 1.84 | 1.981 |
| 1042 | 1.84 | 1.981 |
| 1043 | 1.84 | 1.981 |
| 1044 | 1.845 | 1.981 |
| 1045 | 1.855 | 1.981 |
| 1046 | 1.865 | 1.981 |
| 1047 | 1.865 | 1.981 |
| 1048 | 1.865 | 1.981 |
| 1049 | 1.865 | 1.981 |
| 1050 | 1.86 | 1.981 |
| 1051 | 1.86 | 1.981 |
| 1052 | 1.865 | 1.981 |
| 1053 | 1.86 | 1.981 |
| 1054 | 1.86 | 1.981 |
| 1055 | 1.865 | 1.981 |
| 1056 | 1.875 | 1.981 |
| 1057 | 1.885 | 1.981 |
| 1058 | 1.895 | 1.981 |
| 1059 | 1.88 | 1.981 |
| 1060 | 1.86 | 1.981 |
| 1061 | 1.835 | 1.981 |
| 1062 | 1.84 | 1.981 |
| 1063 | 1.84 | 1.981 |
| 1064 | 1.84 | 1.981 |
| 1065 | 1.84 | 1.981 |
| 1066 | 1.855 | 1.981 |
| 1067 | 1.85 | 1.981 |
| 1068 | 1.855 | 1.981 |
| 1069 | 1.85 | 1.981 |
| 1070 | 1.84 | 1.981 |
| 1071 | 1.845 | 1.981 |
| 1072 | 1.845 | 1.981 |
| 1073 | 1.845 | 1.981 |
| 1074 | 1.85 | 1.981 |
| 1075 | 1.86 | 1.981 |
| 1076 | 1.855 | 1.981 |
| 1077 | 1.85 | 1.981 |
| 1078 | 1.845 | 1.981 |
| 1079 | 1.825 | 1.981 |
| 1080 | 1.825 | 1.981 |
| 1081 | 1.825 | 1.981 |
| 1082 | 1.825 | 1.981 |
| 1083 | 1.825 | 1.981 |
| 1084 | 1.815 | 1.981 |
| 1085 | 1.815 | 1.981 |
| 1086 | 1.815 | 1.981 |
| 1087 | 1.815 | 1.981 |
| 1088 | 1.825 | 1.981 |
| 1089 | 1.82 | 1.981 |
| 1090 | 1.825 | 1.981 |
| 1091 | 1.83 | 1.981 |
| 1092 | 1.835 | 1.981 |
| 1093 | 1.855 | 1.981 |
| 1094 | 1.85 | 1.981 |
| 1095 | 1.855 | 1.981 |
| 1096 | 1.865 | 1.981 |
| 1097 | 1.865 | 1.981 |
| 1098 | 1.865 | 1.981 |
| 1099 | 1.875 | 1.981 |
| 1100 | 1.875 | 1.981 |
| 1101 | 1.875 | 1.981 |
| 1102 | 1.875 | 1.981 |
| 1103 | 1.875 | 1.981 |
| 1104 | 1.885 | 1.981 |
| 1105 | 1.885 | 1.981 |
| 1106 | 1.88 | 1.981 |
| 1107 | 1.87 | 1.981 |
| 1108 | 1.86 | 1.981 |
| 1109 | 1.87 | 1.981 |
| 1110 | 1.885 | 1.981 |
| 1111 | 1.905 | 1.981 |
| 1112 | 1.925 | 1.981 |
| 1113 | 1.945 | 1.981 |
| 1114 | 1.93 | 1.981 |
| 1115 | 1.915 | 1.981 |
| 1116 | 1.9 | 1.981 |
| 1117 | 1.87 | 1.981 |
| 1118 | 1.875 | 1.981 |
| 1119 | 1.885 | 1.981 |
| 1120 | 1.885 | 1.981 |
| 1121 | 1.885 | 1.981 |
| 1122 | 1.88 | 1.981 |
| 1123 | 1.87 | 1.981 |
| 1124 | 1.855 | 1.981 |
| 1125 | 1.84 | 1.981 |
| 1126 | 1.815 | 1.981 |
| 1127 | 1.815 | 1.981 |
| 1128 | 1.815 | 1.981 |
| 1129 | 1.82 | 1.981 |
| 1130 | 1.82 | 1.981 |
| 1131 | 1.82 | 1.981 |
| 1132 | 1.815 | 1.981 |
| 1133 | 1.815 | 1.981 |
| 1134 | 1.815 | 1.981 |
| 1135 | 1.815 | 1.981 |
| 1136 | 1.82 | 1.981 |
| 1137 | 1.83 | 1.981 |
| 1138 | 1.83 | 1.981 |
| 1139 | 1.83 | 1.981 |
| 1140 | 1.825 | 1.981 |
| 1141 | 1.825 | 1.981 |
| 1142 | 1.83 | 1.981 |
| 1143 | 1.835 | 1.981 |
| 1144 | 1.84 | 1.981 |
| 1145 | 1.86 | 1.981 |
| 1146 | 1.885 | 1.981 |
| 1147 | 1.885 | 1.981 |
| 1148 | 1.88 | 1.981 |
| 1149 | 1.87 | 1.981 |
| 1150 | 1.855 | 1.981 |
| 1151 | 1.84 | 1.981 |
| 1152 | 1.84 | 1.981 |
| 1153 | 1.84 | 1.981 |
| 1154 | 1.835 | 1.981 |
| 1155 | 1.83 | 1.981 |
| 1156 | 1.825 | 1.981 |
| 1157 | 1.825 | 1.981 |
| 1158 | 1.825 | 1.981 |
| 1159 | 1.825 | 1.981 |
| 1160 | 1.83 | 1.981 |
| 1161 | 1.825 | 1.981 |
| 1162 | 1.83 | 1.981 |
| 1163 | 1.825 | 1.981 |
| 1164 | 1.83 | 1.981 |
| 1165 | 1.825 | 1.981 |
| 1166 | 1.82 | 1.981 |
| 1167 | 1.83 | 1.981 |
| 1168 | 1.845 | 1.981 |
| 1169 | 1.845 | 1.981 |
| 1170 | 1.845 | 1.981 |
| 1171 | 1.85 | 1.981 |
| 1172 | 1.85 | 1.981 |
| 1173 | 1.845 | 1.981 |
| 1174 | 1.845 | 1.981 |
| 1175 | 1.84 | 1.981 |
| 1176 | 1.83 | 1.981 |
| 1177 | 1.83 | 1.981 |
| 1178 | 1.835 | 1.981 |
| 1179 | 1.84 | 1.981 |
| 1180 | 1.83 | 1.981 |
| 1181 | 1.815 | 1.981 |
| 1182 | 1.815 | 1.981 |
| 1183 | 1.815 | 1.981 |
| 1184 | 1.82 | 1.981 |
| 1185 | 1.825 | 1.981 |
| 1186 | 1.84 | 1.981 |
| 1187 | 1.84 | 1.981 |
| 1188 | 1.835 | 1.981 |
| 1189 | 1.83 | 1.981 |
| 1190 | 1.83 | 1.981 |
| 1191 | 1.825 | 1.981 |
| 1192 | 1.825 | 1.981 |
| 1193 | 1.83 | 1.981 |
| 1194 | 1.84 | 1.981 |
| 1195 | 1.855 | 1.981 |
| 1196 | 1.855 | 1.981 |
| 1197 | 1.855 | 1.981 |
| 1198 | 1.865 | 1.981 |
| 1199 | 1.875 | 1.981 |
| 1200 | 1.895 | 1.981 |
| 1201 | 1.915 | 1.981 |
| 1202 | 1.935 | 1.981 |
| 1203 | 1.935 | 1.981 |
| 1204 | 1.94 | 1.981 |
| 1205 | 1.935 | 1.981 |
| 1206 | 1.925 | 1.981 |
| 1207 | 1.93 | 1.981 |
| 1208 | 1.94 | 1.981 |
| 1209 | 1.935 | 1.981 |
| 1210 | 1.94 | 1.981 |
| 1211 | 1.935 | 1.981 |
| 1212 | 1.935 | 1.981 |
| 1213 | 1.935 | 1.981 |
| 1214 | 1.925 | 1.981 |
| 1215 | 1.915 | 1.981 |
| 1216 | 1.915 | 1.981 |
| 1217 | 1.92 | 1.981 |
| 1218 | 1.93 | 1.981 |
| 1219 | 1.93 | 1.981 |
| 1220 | 1.925 | 1.981 |
| 1221 | 1.92 | 1.981 |
| 1222 | 1.93 | 1.981 |
| 1223 | 1.94 | 1.981 |
| 1224 | 1.95 | 1.981 |
| 1225 | 1.96 | 1.981 |
| 1226 | 1.96 | 1.981 |
| 1227 | 1.965 | 1.981 |
| 1228 | 1.96 | 1.981 |
| 1229 | 1.965 | 1.981 |
| 1230 | 1.975 | 1.981 |
| 1231 | 1.97 | 1.981 |
| 1232 | 1.96 | 1.981 |
| 1233 | 1.95 | 1.981 |
| 1234 | 1.95 | 1.981 |
| 1235 | 1.945 | 1.981 |
| 1236 | 1.945 | 1.981 |
| 1237 | 1.945 | 1.981 |
| 1238 | 1.94 | 1.981 |
| 1239 | 1.945 | 1.981 |
| 1240 | 1.95 | 1.981 |
| 1241 | 1.95 | 1.981 |
| 1242 | 1.95 | 1.981 |
| 1243 | 1.96 | 1.981 |
| 1244 | 1.97 | 1.981 |
| 1245 | 1.96 | 1.981 |
| 1246 | 1.945 | 1.981 |
| 1247 | 1.95 | 1.981 |
| 1248 | 1.945 | 1.981 |
| 1249 | 1.945 | 1.981 |
| 1250 | 1.95 | 1.981 |
| 1251 | 1.95 | 1.981 |
| 1252 | 1.95 | 1.981 |
| 1253 | 1.96 | 1.981 |
| 1254 | 1.975 | 1.981 |
| 1255 | 1.97 | 1.981 |
| 1256 | 1.965 | 1.981 |
| 1257 | 1.96 | 1.981 |
| 1258 | 1.94 | 1.981 |
| 1259 | 1.94 | 1.981 |
| 1260 | 1.945 | 1.981 |
| 1261 | 1.945 | 1.981 |
| 1262 | 1.945 | 1.981 |
| 1263 | 1.955 | 1.981 |
| 1264 | 1.965 | 1.981 |
| 1265 | 1.975 | 1.981 |
| 1266 | 1.985 | 1.981 |
| 1267 | 1.985 | 1.981 |
| 1268 | 1.98 | 1.981 |
| 1269 | 1.985 | 1.981 |
| 1270 | 1.985 | 1.981 |
| 1271 | 1.98 | 1.981 |
| 1272 | 1.98 | 1.981 |
| 1273 | 1.985 | 1.981 |
| 1274 | 1.98 | 1.981 |
| 1275 | 1.975 | 1.981 |
| 1276 | 1.985 | 1.981 |
| 1277 | 1.995 | 1.981 |
| 1278 | 1.985 | 1.981 |
| 1279 | 1.99 | 1.981 |
| 1280 | 1.99 | 1.981 |
| 1281 | 1.995 | 1.981 |
| 1282 | 1.995 | 1.981 |
| 1283 | 1.995 | 1.981 |
| 1284 | 2.005 | 1.981 |
| 1285 | 2.005 | 1.981 |
| 1286 | 2.005 | 1.981 |
| 1287 | 2 | 1.981 |
| 1288 | 1.99 | 1.981 |
| 1289 | 1.99 | 1.981 |
| 1290 | 1.985 | 1.981 |
| 1291 | 1.98 | 1.981 |
| 1292 | 1.975 | 1.981 |
| 1293 | 1.97 | 1.981 |
| 1294 | 1.97 | 1.981 |
| 1295 | 1.97 | 1.981 |
| 1296 | 1.97 | 1.981 |
| 1297 | 1.985 | 1.981 |
| 1298 | 1.98 | 1.981 |
| 1299 | 1.975 | 1.981 |
| 1300 | 1.985 | 1.981 |
| 1301 | 1.98 | 1.981 |
| 1302 | 1.98 | 1.981 |
| 1303 | 1.975 | 1.981 |
| 1304 | 1.97 | 1.981 |
| 1305 | 1.97 | 1.981 |
| 1306 | 1.975 | 1.981 |
| 1307 | 1.975 | 1.981 |
| 1308 | 1.975 | 1.981 |
| 1309 | 1.975 | 1.981 |
| 1310 | 1.975 | 1.981 |
| 1311 | 1.955 | 1.981 |
| 1312 | 1.93 | 1.981 |
| 1313 | 1.905 | 1.981 |
| 1314 | 1.905 | 1.981 |
| 1315 | 1.9 | 1.981 |
| 1316 | 1.89 | 1.981 |
| 1317 | 1.89 | 1.981 |
| 1318 | 1.885 | 1.981 |
| 1319 | 1.88 | 1.981 |
| 1320 | 1.89 | 1.981 |
| 1321 | 1.89 | 1.981 |
| 1322 | 1.89 | 1.981 |
| 1323 | 1.89 | 1.981 |
| 1324 | 1.895 | 1.981 |
| 1325 | 1.89 | 1.981 |
| 1326 | 1.895 | 1.981 |
| 1327 | 1.895 | 1.981 |
| 1328 | 1.895 | 1.981 |
| 1329 | 1.89 | 1.981 |
| 1330 | 1.895 | 1.981 |
| 1331 | 1.895 | 1.981 |
| 1332 | 1.895 | 1.981 |
| 1333 | 1.9 | 1.981 |
| 1334 | 1.905 | 1.981 |
| 1335 | 1.905 | 1.981 |
| 1336 | 1.905 | 1.981 |
| 1337 | 1.895 | 1.981 |
| 1338 | 1.895 | 1.981 |
| 1339 | 1.895 | 1.981 |
| 1340 | 1.895 | 1.981 |
| 1341 | 1.895 | 1.981 |
| 1342 | 1.89 | 1.981 |
| 1343 | 1.88 | 1.981 |
| 1344 | 1.865 | 1.981 |
| 1345 | 1.85 | 1.981 |
| 1346 | 1.835 | 1.981 |
| 1347 | 1.85 | 1.981 |
| 1348 | 1.87 | 1.981 |
| 1349 | 1.895 | 1.981 |
| 1350 | 1.925 | 1.981 |
| 1351 | 1.92 | 1.981 |
| 1352 | 1.92 | 1.981 |
| 1353 | 1.92 | 1.981 |
| 1354 | 1.92 | 1.981 |
| 1355 | 1.92 | 1.981 |
| 1356 | 1.92 | 1.981 |
| 1357 | 1.935 | 1.981 |
| 1358 | 1.955 | 1.981 |
| 1359 | 1.98 | 1.981 |
| 1360 | 2.005 | 1.981 |
| 1361 | 2.04 | 1.981 |
| 1362 | 2.035 | 1.981 |
| 1363 | 2.035 | 1.981 |
| 1364 | 2.035 | 1.981 |
| 1365 | 2.035 | 1.981 |
| 1366 | 2.03 | 1.981 |
| 1367 | 2.025 | 1.981 |
| 1368 | 2.01 | 1.981 |
| 1369 | 2.01 | 1.981 |
| 1370 | 2.01 | 1.981 |
| 1371 | 2.01 | 1.981 |
| 1372 | 2.01 | 1.981 |
| 1373 | 2.01 | 1.981 |
| 1374 | 2.01 | 1.981 |
| 1375 | 2.01 | 1.981 |
| 1376 | 2.01 | 1.981 |
| 1377 | 2.015 | 1.981 |
| 1378 | 2.02 | 1.981 |
| 1379 | 2.01 | 1.981 |
| 1380 | 2.015 | 1.981 |
| 1381 | 2.025 | 1.981 |
| 1382 | 2.04 | 1.981 |
| 1383 | 2.06 | 1.981 |
| 1384 | 2.08 | 1.981 |
| 1385 | 2.07 | 1.981 |
| 1386 | 2.055 | 1.981 |
| 1387 | 2.06 | 1.981 |
| 1388 | 2.07 | 1.981 |
| 1389 | 2.065 | 1.981 |
| 1390 | 2.065 | 1.981 |
| 1391 | 2.065 | 1.981 |
| 1392 | 2.07 | 1.981 |
| 1393 | 2.075 | 1.981 |
| 1394 | 2.08 | 1.981 |
| 1395 | 2.085 | 1.981 |
| 1396 | 2.11 | 1.981 |
| 1397 | 2.135 | 1.981 |
| 1398 | 2.125 | 1.981 |
| 1399 | 2.11 | 1.981 |
| 1400 | 2.095 | 1.981 |
| 1401 | 2.08 | 1.981 |
| 1402 | 2.05 | 1.981 |
| 1403 | 2.055 | 1.981 |
| 1404 | 2.05 | 1.981 |
| 1405 | 2.055 | 1.981 |
| 1406 | 2.065 | 1.981 |
| 1407 | 2.06 | 1.981 |
| 1408 | 2.05 | 1.981 |
| 1409 | 2.055 | 1.981 |
| 1410 | 2.05 | 1.981 |
| 1411 | 2.055 | 1.981 |
| 1412 | 2.065 | 1.981 |
| 1413 | 2.075 | 1.981 |
| 1414 | 2.075 | 1.981 |
| 1415 | 2.07 | 1.981 |
| 1416 | 2.07 | 1.981 |
| 1417 | 2.065 | 1.981 |
| 1418 | 2.055 | 1.981 |
| 1419 | 2.055 | 1.981 |
| 1420 | 2.055 | 1.981 |
| 1421 | 2.05 | 1.981 |
| 1422 | 2.045 | 1.981 |
| 1423 | 2.03 | 1.981 |
| 1424 | 2.01 | 1.981 |
| 1425 | 1.99 | 1.981 |
| 1426 | 1.99 | 1.981 |
| 1427 | 1.985 | 1.981 |
| 1428 | 1.985 | 1.981 |
| 1429 | 1.98 | 1.981 |
| 1430 | 1.97 | 1.981 |
| 1431 | 1.97 | 1.981 |
| 1432 | 1.975 | 1.981 |
| 1433 | 1.97 | 1.981 |
| 1434 | 1.975 | 1.981 |
| 1435 | 1.975 | 1.981 |
| 1436 | 1.975 | 1.981 |
| 1437 | 1.98 | 1.981 |
| 1438 | 1.98 | 1.981 |
| 1439 | 1.98 | 1.981 |
| 1440 | 1.98 | 1.981 |
| 1441 | 1.98 | 1.981 |
| 1442 | 1.975 | 1.981 |
| 1443 | 1.97 | 1.981 |
| 1444 | 1.965 | 1.981 |
| 1445 | 1.965 | 1.981 |
| 1446 | 1.97 | 1.981 |
| 1447 | 1.975 | 1.981 |
| 1448 | 1.975 | 1.981 |
| 1449 | 1.975 | 1.981 |
| 1450 | 1.975 | 1.981 |
| 1451 | 1.985 | 1.981 |
| 1452 | 1.995 | 1.981 |
| 1453 | 1.985 | 1.981 |
| 1454 | 1.975 | 1.981 |
| 1455 | 1.985 | 1.981 |
| 1456 | 1.98 | 1.981 |
| 1457 | 1.97 | 1.981 |
| 1458 | 1.975 | 1.981 |
| 1459 | 1.985 | 1.981 |
| 1460 | 1.98 | 1.981 |
| 1461 | 1.985 | 1.981 |
| 1462 | 1.99 | 1.981 |
| 1463 | 1.98 | 1.981 |
| 1464 | 1.965 | 1.981 |
| 1465 | 1.945 | 1.981 |
| 1466 | 1.92 | 1.981 |
| 1467 | 1.925 | 1.981 |
| 1468 | 1.925 | 1.981 |
| 1469 | 1.925 | 1.981 |
| 1470 | 1.935 | 1.981 |
| 1471 | 1.935 | 1.981 |
| 1472 | 1.94 | 1.981 |
| 1473 | 1.935 | 1.981 |
| 1474 | 1.935 | 1.981 |
| 1475 | 1.935 | 1.981 |
| 1476 | 1.935 | 1.981 |
| 1477 | 1.935 | 1.981 |
| 1478 | 1.955 | 1.981 |
| 1479 | 1.975 | 1.981 |
| 1480 | 2.005 | 1.981 |
| 1481 | 2.035 | 1.981 |
| 1482 | 2.035 | 1.981 |
| 1483 | 2.035 | 1.981 |
| 1484 | 2.025 | 1.981 |
| 1485 | 2.03 | 1.981 |
| 1486 | 2.04 | 1.981 |
| 1487 | 2.055 | 1.981 |
| 1488 | 2.075 | 1.981 |
| 1489 | 2.1 | 1.981 |
| 1490 | 2.13 | 1.981 |
| 1491 | 2.125 | 1.981 |
| 1492 | 2.12 | 1.981 |
| 1493 | 2.115 | 1.981 |
| 1494 | 2.115 | 1.981 |
| 1495 | 2.115 | 1.981 |
| 1496 | 2.105 | 1.981 |
| 1497 | 2.09 | 1.981 |
| 1498 | 2.09 | 1.981 |
| 1499 | 2.09 | 1.981 |
| 1500 | 2.08 | 1.981 |
| 1501 | 2.085 | 1.981 |
| 1502 | 2.095 | 1.981 |
| 1503 | 2.095 | 1.981 |
| 1504 | 2.09 | 1.981 |
| 1505 | 2.09 | 1.981 |
| 1506 | 2.09 | 1.981 |
| 1507 | 2.09 | 1.981 |
| 1508 | 2.09 | 1.981 |
| 1509 | 2.09 | 1.981 |
| 1510 | 2.075 | 1.981 |
| 1511 | 2.08 | 1.981 |
| 1512 | 2.09 | 1.981 |
| 1513 | 2.1 | 1.981 |
| 1514 | 2.12 | 1.981 |
| 1515 | 2.12 | 1.981 |
| 1516 | 2.125 | 1.981 |
| 1517 | 2.135 | 1.981 |
| 1518 | 2.15 | 1.981 |
| 1519 | 2.165 | 1.981 |
| 1520 | 2.18 | 1.981 |
| 1521 | 2.21 | 1.981 |
| 1522 | 2.21 | 1.981 |
| 1523 | 2.215 | 1.981 |
| 1524 | 2.22 | 1.981 |
| 1525 | 2.235 | 1.981 |
| 1526 | 2.23 | 1.981 |
| 1527 | 2.23 | 1.981 |
| 1528 | 2.23 | 1.981 |
| 1529 | 2.235 | 1.981 |
| 1530 | 2.23 | 1.981 |
| 1531 | 2.23 | 1.981 |
| 1532 | 2.235 | 1.981 |
| 1533 | 2.24 | 1.981 |
| 1534 | 2.23 | 1.981 |
| 1535 | 2.23 | 1.981 |
| 1536 | 2.225 | 1.981 |
| 1537 | 2.23 | 1.981 |
| 1538 | 2.24 | 1.981 |
| 1539 | 2.255 | 1.981 |
| 1540 | 2.255 | 1.981 |
| 1541 | 2.255 | 1.981 |
| 1542 | 2.255 | 1.981 |
| 1543 | 2.255 | 1.981 |
| 1544 | 2.255 | 1.981 |
| 1545 | 2.255 | 1.981 |
| 1546 | 2.255 | 1.981 |
| 1547 | 2.24 | 1.981 |
| 1548 | 2.225 | 1.981 |
| 1549 | 2.2 | 1.981 |
| 1550 | 2.17 | 1.981 |
| 1551 | 2.17 | 1.981 |
| 1552 | 2.175 | 1.981 |
| 1553 | 2.175 | 1.981 |
| 1554 | 2.175 | 1.981 |
| 1555 | 2.175 | 1.981 |
| 1556 | 2.165 | 1.981 |
| 1557 | 2.155 | 1.981 |
| 1558 | 2.145 | 1.981 |
| 1559 | 2.12 | 1.981 |
| 1560 | 2.09 | 1.981 |
| 1561 | 2.055 | 1.981 |
| 1562 | 2.06 | 1.981 |
| 1563 | 2.07 | 1.981 |
| 1564 | 2.08 | 1.981 |
| 1565 | 2.08 | 1.981 |
| 1566 | 2.08 | 1.981 |
| 1567 | 2.08 | 1.981 |
| 1568 | 2.08 | 1.981 |
| 1569 | 2.08 | 1.981 |
| 1570 | 2.08 | 1.981 |
| 1571 | 2.075 | 1.981 |
| 1572 | 2.08 | 1.981 |
| 1573 | 2.08 | 1.981 |
| 1574 | 2.08 | 1.981 |
| 1575 | 2.085 | 1.981 |
| 1576 | 2.085 | 1.981 |
| 1577 | 2.08 | 1.981 |
| 1578 | 2.075 | 1.981 |
| 1579 | 2.085 | 1.981 |
| 1580 | 2.095 | 1.981 |
| 1581 | 2.085 | 1.981 |
| 1582 | 2.075 | 1.981 |
| 1583 | 2.065 | 1.981 |
| 1584 | 2.04 | 1.981 |
| 1585 | 2.045 | 1.981 |
| 1586 | 2.045 | 1.981 |
| 1587 | 2.04 | 1.981 |
| 1588 | 2.035 | 1.981 |
| 1589 | 2.035 | 1.981 |
| 1590 | 2.04 | 1.981 |
| 1591 | 2.05 | 1.981 |
| 1592 | 2.06 | 1.981 |
| 1593 | 2.07 | 1.981 |
| 1594 | 2.055 | 1.981 |
| 1595 | 2.035 | 1.981 |
| 1596 | 2.015 | 1.981 |
| 1597 | 1.985 | 1.981 |
| 1598 | 1.985 | 1.981 |
| 1599 | 1.985 | 1.981 |
| 1600 | 1.985 | 1.981 |
| 1601 | 1.985 | 1.981 |
| 1602 | 1.985 | 1.981 |
| 1603 | 1.985 | 1.981 |
| 1604 | 1.995 | 1.981 |
| 1605 | 2.005 | 1.981 |
| 1606 | 2.015 | 1.981 |
| 1607 | 2.04 | 1.981 |
| 1608 | 2.07 | 1.981 |
| 1609 | 2.1 | 1.981 |
| 1610 | 2.1 | 1.981 |
| 1611 | 2.095 | 1.981 |
| 1612 | 2.09 | 1.981 |
| 1613 | 2.075 | 1.981 |
| 1614 | 2.08 | 1.981 |
| 1615 | 2.09 | 1.981 |
| 1616 | 2.09 | 1.981 |
| 1617 | 2.09 | 1.981 |
| 1618 | 2.095 | 1.981 |
| 1619 | 2.095 | 1.981 |
| 1620 | 2.1 | 1.981 |
| 1621 | 2.11 | 1.981 |
| 1622 | 2.12 | 1.981 |
| 1623 | 2.14 | 1.981 |
| 1624 | 2.165 | 1.981 |
| 1625 | 2.19 | 1.981 |
| 1626 | 2.225 | 1.981 |
| 1627 | 2.225 | 1.981 |
| 1628 | 2.23 | 1.981 |
| 1629 | 2.23 | 1.981 |
| 1630 | 2.235 | 1.981 |
| 1631 | 2.235 | 1.981 |
| 1632 | 2.235 | 1.981 |
| 1633 | 2.235 | 1.981 |
| 1634 | 2.235 | 1.981 |
| 1635 | 2.235 | 1.981 |
| 1636 | 2.235 | 1.981 |
| 1637 | 2.23 | 1.981 |
| 1638 | 2.235 | 1.981 |
| 1639 | 2.23 | 1.981 |
| 1640 | 2.22 | 1.981 |
| 1641 | 2.22 | 1.981 |
| 1642 | 2.225 | 1.981 |
| 1643 | 2.23 | 1.981 |
| 1644 | 2.235 | 1.981 |
| 1645 | 2.235 | 1.981 |
| 1646 | 2.23 | 1.981 |
| 1647 | 2.225 | 1.981 |
| 1648 | 2.235 | 1.981 |
| 1649 | 2.235 | 1.981 |
| 1650 | 2.235 | 1.981 |
| 1651 | 2.235 | 1.981 |
| 1652 | 2.22 | 1.981 |
| 1653 | 2.225 | 1.981 |
| 1654 | 2.22 | 1.981 |
| 1655 | 2.215 | 1.981 |
| 1656 | 2.215 | 1.981 |
| 1657 | 2.22 | 1.981 |
| 1658 | 2.215 | 1.981 |
| 1659 | 2.205 | 1.981 |
| 1660 | 2.21 | 1.981 |
| 1661 | 2.205 | 1.981 |
| 1662 | 2.2 | 1.981 |
| 1663 | 2.2 | 1.981 |
| 1664 | 2.205 | 1.981 |
| 1665 | 2.215 | 1.981 |
| 1666 | 2.215 | 1.981 |
| 1667 | 2.215 | 1.981 |
| 1668 | 2.215 | 1.981 |
| 1669 | 2.21 | 1.981 |
| 1670 | 2.205 | 1.981 |
| 1671 | 2.215 | 1.981 |
| 1672 | 2.225 | 1.981 |
| 1673 | 2.245 | 1.981 |
| 1674 | 2.245 | 1.981 |
| 1675 | 2.24 | 1.981 |
| 1676 | 2.23 | 1.981 |
| 1677 | 2.215 | 1.981 |
| 1678 | 2.2 | 1.981 |
| 1679 | 2.185 | 1.981 |
| 1680 | 2.17 | 1.981 |
| 1681 | 2.155 | 1.981 |
| 1682 | 2.155 | 1.981 |
| 1683 | 2.15 | 1.981 |
| 1684 | 2.155 | 1.981 |
| 1685 | 2.15 | 1.981 |
| 1686 | 2.145 | 1.981 |
| 1687 | 2.13 | 1.981 |
| 1688 | 2.115 | 1.981 |
| 1689 | 2.1 | 1.981 |
| 1690 | 2.085 | 1.981 |
| 1691 | 2.105 | 1.981 |
| 1692 | 2.125 | 1.981 |
| 1693 | 2.145 | 1.981 |
| 1694 | 2.145 | 1.981 |
| 1695 | 2.14 | 1.981 |
| 1696 | 2.14 | 1.981 |
| 1697 | 2.145 | 1.981 |
| 1698 | 2.145 | 1.981 |
| 1699 | 2.145 | 1.981 |
| 1700 | 2.145 | 1.981 |
| 1701 | 2.14 | 1.981 |
| 1702 | 2.13 | 1.981 |
| 1703 | 2.135 | 1.981 |
| 1704 | 2.135 | 1.981 |
| 1705 | 2.14 | 1.981 |
| 1706 | 2.145 | 1.981 |
| 1707 | 2.145 | 1.981 |
| 1708 | 2.14 | 1.981 |
| 1709 | 2.135 | 1.981 |
| 1710 | 2.135 | 1.981 |
| 1711 | 2.13 | 1.981 |
| 1712 | 2.125 | 1.981 |
| 1713 | 2.12 | 1.981 |
| 1714 | 2.1 | 1.981 |
| 1715 | 2.105 | 1.981 |
| 1716 | 2.1 | 1.981 |
| 1717 | 2.095 | 1.981 |
| 1718 | 2.09 | 1.981 |
| 1719 | 2.07 | 1.981 |
| 1720 | 2.045 | 1.981 |
| 1721 | 2.02 | 1.981 |
| 1722 | 2.02 | 1.981 |
| 1723 | 2.015 | 1.981 |
| 1724 | 2.01 | 1.981 |
| 1725 | 1.995 | 1.981 |
| 1726 | 1.995 | 1.981 |
| 1727 | 1.995 | 1.981 |
| 1728 | 1.995 | 1.981 |
| 1729 | 1.995 | 1.981 |
| 1730 | 2.005 | 1.981 |
| 1731 | 2.005 | 1.981 |
| 1732 | 2 | 1.981 |
| 1733 | 1.995 | 1.981 |
| 1734 | 2.005 | 1.981 |
| 1735 | 2.02 | 1.981 |
| 1736 | 2.04 | 1.981 |
| 1737 | 2.035 | 1.981 |
| 1738 | 2.025 | 1.981 |
| 1739 | 2.015 | 1.981 |
| 1740 | 2.025 | 1.981 |
| 1741 | 2.025 | 1.981 |
| 1742 | 2.03 | 1.981 |
| 1743 | 2.03 | 1.981 |
| 1744 | 2.035 | 1.981 |
| 1745 | 2.03 | 1.981 |
| 1746 | 2.025 | 1.981 |
| 1747 | 2.025 | 1.981 |
| 1748 | 2.025 | 1.981 |
| 1749 | 2.025 | 1.981 |
| 1750 | 2.03 | 1.981 |
| 1751 | 2.03 | 1.981 |
| 1752 | 2.03 | 1.981 |
| 1753 | 2.03 | 1.981 |
| 1754 | 2.03 | 1.981 |
| 1755 | 2.03 | 1.981 |
| 1756 | 2.04 | 1.981 |
| 1757 | 2.035 | 1.981 |
| 1758 | 2.03 | 1.981 |
| 1759 | 2.04 | 1.981 |
| 1760 | 2.055 | 1.981 |
| 1761 | 2.075 | 1.981 |
| 1762 | 2.07 | 1.981 |
| 1763 | 2.065 | 1.981 |
| 1764 | 2.05 | 1.981 |
| 1765 | 2.05 | 1.981 |
| 1766 | 2.055 | 1.981 |
| 1767 | 2.06 | 1.981 |
| 1768 | 2.06 | 1.981 |
| 1769 | 2.06 | 1.981 |
| 1770 | 2.065 | 1.981 |
| 1771 | 2.075 | 1.981 |
| 1772 | 2.085 | 1.981 |
| 1773 | 2.105 | 1.981 |
| 1774 | 2.105 | 1.981 |
| 1775 | 2.105 | 1.981 |
| 1776 | 2.115 | 1.981 |
| 1777 | 2.115 | 1.981 |
| 1778 | 2.11 | 1.981 |
| 1779 | 2.105 | 1.981 |
| 1780 | 2.09 | 1.981 |
| 1781 | 2.09 | 1.981 |
| 1782 | 2.09 | 1.981 |
| 1783 | 2.08 | 1.981 |
| 1784 | 2.085 | 1.981 |
| 1785 | 2.09 | 1.981 |
| 1786 | 2.09 | 1.981 |
| 1787 | 2.09 | 1.981 |
| 1788 | 2.085 | 1.981 |
| 1789 | 2.09 | 1.981 |
| 1790 | 2.085 | 1.981 |
| 1791 | 2.075 | 1.981 |
| 1792 | 2.065 | 1.981 |
| 1793 | 2.055 | 1.981 |
| 1794 | 2.055 | 1.981 |
| 1795 | 2.06 | 1.981 |
| 1796 | 2.065 | 1.981 |
| 1797 | 2.065 | 1.981 |
| 1798 | 2.065 | 1.981 |
| 1799 | 2.07 | 1.981 |
| 1800 | 2.075 | 1.981 |
| 1801 | 2.065 | 1.981 |
| 1802 | 2.07 | 1.981 |
| 1803 | 2.075 | 1.981 |
| 1804 | 2.065 | 1.981 |
| 1805 | 2.05 | 1.981 |
| 1806 | 2.035 | 1.981 |
| 1807 | 2.02 | 1.981 |
| 1808 | 1.99 | 1.981 |
| 1809 | 1.955 | 1.981 |
| 1810 | 1.955 | 1.981 |
| 1811 | 1.955 | 1.981 |
| 1812 | 1.95 | 1.981 |
| 1813 | 1.95 | 1.981 |
| 1814 | 1.945 | 1.981 |
| 1815 | 1.935 | 1.981 |
| 1816 | 1.94 | 1.981 |
| 1817 | 1.94 | 1.981 |
| 1818 | 1.94 | 1.981 |
| 1819 | 1.95 | 1.981 |
| 1820 | 1.945 | 1.981 |
| 1821 | 1.94 | 1.981 |
| 1822 | 1.925 | 1.981 |
| 1823 | 1.905 | 1.981 |
| 1824 | 1.885 | 1.981 |
| 1825 | 1.855 | 1.981 |
| 1826 | 1.82 | 1.981 |
| 1827 | 1.82 | 1.981 |
| 1828 | 1.82 | 1.981 |
| 1829 | 1.83 | 1.981 |
| 1830 | 1.84 | 1.981 |
| 1831 | 1.84 | 1.981 |
| 1832 | 1.835 | 1.981 |
| 1833 | 1.835 | 1.981 |
| 1834 | 1.83 | 1.981 |
| 1835 | 1.835 | 1.981 |
| 1836 | 1.845 | 1.981 |
| 1837 | 1.86 | 1.981 |
| 1838 | 1.855 | 1.981 |
| 1839 | 1.855 | 1.981 |
| 1840 | 1.86 | 1.981 |
| 1841 | 1.87 | 1.981 |
| 1842 | 1.88 | 1.981 |
| 1843 | 1.89 | 1.981 |
| 1844 | 1.9 | 1.981 |
| 1845 | 1.93 | 1.981 |
| 1846 | 1.93 | 1.981 |
| 1847 | 1.925 | 1.981 |
| 1848 | 1.92 | 1.981 |
| 1849 | 1.93 | 1.981 |
| 1850 | 1.94 | 1.981 |
| 1851 | 1.93 | 1.981 |
| 1852 | 1.93 | 1.981 |
| 1853 | 1.93 | 1.981 |
| 1854 | 1.93 | 1.981 |
| 1855 | 1.925 | 1.981 |
| 1856 | 1.925 | 1.981 |
| 1857 | 1.925 | 1.981 |
| 1858 | 1.925 | 1.981 |
| 1859 | 1.925 | 1.981 |
| 1860 | 1.92 | 1.981 |
| 1861 | 1.925 | 1.981 |
| 1862 | 1.93 | 1.981 |
| 1863 | 1.93 | 1.981 |
| 1864 | 1.93 | 1.981 |
| 1865 | 1.92 | 1.981 |
| 1866 | 1.925 | 1.981 |
| 1867 | 1.93 | 1.981 |
| 1868 | 1.945 | 1.981 |
| 1869 | 1.965 | 1.981 |
| 1870 | 1.985 | 1.981 |
| 1871 | 1.975 | 1.981 |
| 1872 | 1.965 | 1.981 |
| 1873 | 1.955 | 1.981 |
| 1874 | 1.955 | 1.981 |
| 1875 | 1.955 | 1.981 |
| 1876 | 1.96 | 1.981 |
| 1877 | 1.96 | 1.981 |
| 1878 | 1.96 | 1.981 |
| 1879 | 1.96 | 1.981 |
| 1880 | 1.96 | 1.981 |
| 1881 | 1.94 | 1.981 |
| 1882 | 1.945 | 1.981 |
| 1883 | 1.945 | 1.981 |
| 1884 | 1.94 | 1.981 |
| 1885 | 1.945 | 1.981 |
| 1886 | 1.95 | 1.981 |
| 1887 | 1.95 | 1.981 |
| 1888 | 1.945 | 1.981 |
| 1889 | 1.935 | 1.981 |
| 1890 | 1.925 | 1.981 |
| 1891 | 1.915 | 1.981 |
| 1892 | 1.905 | 1.981 |
| 1893 | 1.895 | 1.981 |
| 1894 | 1.92 | 1.981 |
| 1895 | 1.92 | 1.981 |
| 1896 | 1.92 | 1.981 |
| 1897 | 1.92 | 1.981 |
| 1898 | 1.93 | 1.981 |
| 1899 | 1.925 | 1.981 |
| 1900 | 1.925 | 1.981 |
| 1901 | 1.925 | 1.981 |
| 1902 | 1.925 | 1.981 |
| 1903 | 1.92 | 1.981 |
| 1904 | 1.92 | 1.981 |
| 1905 | 1.915 | 1.981 |
| 1906 | 1.905 | 1.981 |
| 1907 | 1.905 | 1.981 |
| 1908 | 1.91 | 1.981 |
| 1909 | 1.905 | 1.981 |
| 1910 | 1.905 | 1.981 |
| 1911 | 1.905 | 1.981 |
| 1912 | 1.905 | 1.981 |
| 1913 | 1.895 | 1.981 |
| 1914 | 1.895 | 1.981 |
| 1915 | 1.895 | 1.981 |
| 1916 | 1.905 | 1.981 |
| 1917 | 1.9 | 1.981 |
| 1918 | 1.895 | 1.981 |
| 1919 | 1.895 | 1.981 |
| 1920 | 1.895 | 1.981 |
| 1921 | 1.895 | 1.981 |
| 1922 | 1.905 | 1.981 |
| 1923 | 1.905 | 1.981 |
| 1924 | 1.905 | 1.981 |
| 1925 | 1.915 | 1.981 |
| 1926 | 1.93 | 1.981 |
| 1927 | 1.93 | 1.981 |
| 1928 | 1.93 | 1.981 |
| 1929 | 1.925 | 1.981 |
| 1930 | 1.92 | 1.981 |
| 1931 | 1.92 | 1.981 |
| 1932 | 1.925 | 1.981 |
| 1933 | 1.93 | 1.981 |
| 1934 | 1.935 | 1.981 |
| 1935 | 1.92 | 1.981 |
| 1936 | 1.905 | 1.981 |
| 1937 | 1.915 | 1.981 |
| 1938 | 1.93 | 1.981 |
| 1939 | 1.925 | 1.981 |
| 1940 | 1.92 | 1.981 |
| 1941 | 1.93 | 1.981 |
| 1942 | 1.94 | 1.981 |
| 1943 | 1.94 | 1.981 |
| 1944 | 1.935 | 1.981 |
| 1945 | 1.94 | 1.981 |
| 1946 | 1.935 | 1.981 |
| 1947 | 1.935 | 1.981 |
| 1948 | 1.935 | 1.981 |
| 1949 | 1.945 | 1.981 |
| 1950 | 1.955 | 1.981 |
| 1951 | 1.975 | 1.981 |
| 1952 | 1.97 | 1.981 |
| 1953 | 1.97 | 1.981 |
| 1954 | 1.975 | 1.981 |
| 1955 | 1.97 | 1.981 |
| 1956 | 1.96 | 1.981 |
| 1957 | 1.965 | 1.981 |
| 1958 | 1.97 | 1.981 |
| 1959 | 1.975 | 1.981 |
| 1960 | 1.98 | 1.981 |
| 1961 | 1.96 | 1.981 |
| 1962 | 1.96 | 1.981 |
| 1963 | 1.955 | 1.981 |
| 1964 | 1.96 | 1.981 |
| 1965 | 1.96 | 1.981 |
| 1966 | 1.96 | 1.981 |
| 1967 | 1.95 | 1.981 |
| 1968 | 1.95 | 1.981 |
| 1969 | 1.955 | 1.981 |
| 1970 | 1.95 | 1.981 |
| 1971 | 1.945 | 1.981 |
| 1972 | 1.93 | 1.981 |
| 1973 | 1.915 | 1.981 |
| 1974 | 1.925 | 1.981 |
| 1975 | 1.935 | 1.981 |
| 1976 | 1.925 | 1.981 |
| 1977 | 1.925 | 1.981 |
| 1978 | 1.925 | 1.981 |
| 1979 | 1.92 | 1.981 |
| 1980 | 1.92 | 1.981 |
| 1981 | 1.925 | 1.981 |
| 1982 | 1.93 | 1.981 |
| 1983 | 1.945 | 1.981 |
| 1984 | 1.94 | 1.981 |
| 1985 | 1.93 | 1.981 |
| 1986 | 1.935 | 1.981 |
| 1987 | 1.935 | 1.981 |
| 1988 | 1.935 | 1.981 |
| 1989 | 1.93 | 1.981 |
| 1990 | 1.93 | 1.981 |
| 1991 | 1.93 | 1.981 |
| 1992 | 1.925 | 1.981 |
| 1993 | 1.915 | 1.981 |
| 1994 | 1.92 | 1.981 |
| 1995 | 1.925 | 1.981 |
| 1996 | 1.915 | 1.981 |
| 1997 | 1.92 | 1.981 |
| 1998 | 1.93 | 1.981 |
| 1999 | 1.925 | 1.981 |
| 2000 | 1.92 | 1.981 |
| 2001 | 1.93 | 1.981 |
| 2002 | 1.94 | 1.981 |
| 2003 | 1.93 | 1.981 |
| 2004 | 1.93 | 1.981 |
| 2005 | 1.93 | 1.981 |
| 2006 | 1.93 | 1.981 |
| 2007 | 1.93 | 1.981 |
| 2008 | 1.93 | 1.981 |
| 2009 | 1.93 | 1.981 |
| 2010 | 1.93 | 1.981 |
| 2011 | 1.935 | 1.981 |
| 2012 | 1.945 | 1.981 |
| 2013 | 1.96 | 1.981 |
| 2014 | 1.96 | 1.981 |
| 2015 | 1.965 | 1.981 |
| 2016 | 1.97 | 1.981 |
| 2017 | 1.985 | 1.981 |
| 2018 | 1.98 | 1.981 |
| 2019 | 1.97 | 1.981 |
| 2020 | 1.975 | 1.981 |
| 2021 | 1.98 | 1.981 |
| 2022 | 1.98 | 1.981 |
| 2023 | 1.985 | 1.981 |
| 2024 | 1.98 | 1.981 |
| 2025 | 1.98 | 1.981 |
| 2026 | 1.98 | 1.981 |
| 2027 | 1.985 | 1.981 |
| 2028 | 1.99 | 1.981 |
| 2029 | 1.995 | 1.981 |
| 2030 | 2 | 1.981 |
| 2031 | 2.025 | 1.981 |
| 2032 | 2.025 | 1.981 |
| 2033 | 2.025 | 1.981 |
| 2034 | 2.025 | 1.981 |
| 2035 | 2.025 | 1.981 |
| 2036 | 2.015 | 1.981 |
| 2037 | 2 | 1.981 |
| 2038 | 2.005 | 1.981 |
| 2039 | 2.005 | 1.981 |
| 2040 | 2.005 | 1.981 |
| 2041 | 2.005 | 1.981 |
| 2042 | 1.99 | 1.981 |
| 2043 | 1.975 | 1.981 |
| 2044 | 1.96 | 1.981 |
| 2045 | 1.93 | 1.981 |
| 2046 | 1.93 | 1.981 |
| 2047 | 1.93 | 1.981 |
| 2048 | 1.93 | 1.981 |
| 2049 | 1.93 | 1.981 |
| 2050 | 1.915 | 1.981 |
| 2051 | 1.915 | 1.981 |
| 2052 | 1.915 | 1.981 |
| 2053 | 1.915 | 1.981 |
| 2054 | 1.925 | 1.981 |
| 2055 | 1.94 | 1.981 |
| 2056 | 1.94 | 1.981 |
| 2057 | 1.94 | 1.981 |
| 2058 | 1.95 | 1.981 |
| 2059 | 1.95 | 1.981 |
| 2060 | 1.955 | 1.981 |
| 2061 | 1.95 | 1.981 |
| 2062 | 1.945 | 1.981 |
| 2063 | 1.955 | 1.981 |
| 2064 | 1.95 | 1.981 |
| 2065 | 1.95 | 1.981 |
| 2066 | 1.945 | 1.981 |
| 2067 | 1.935 | 1.981 |
| 2068 | 1.925 | 1.981 |
| 2069 | 1.905 | 1.981 |
| 2070 | 1.88 | 1.981 |
| 2071 | 1.88 | 1.981 |
| 2072 | 1.88 | 1.981 |
| 2073 | 1.88 | 1.981 |
| 2074 | 1.88 | 1.981 |
| 2075 | 1.885 | 1.981 |
| 2076 | 1.89 | 1.981 |
| 2077 | 1.89 | 1.981 |
| 2078 | 1.89 | 1.981 |
| 2079 | 1.88 | 1.981 |
| 2080 | 1.865 | 1.981 |
| 2081 | 1.87 | 1.981 |
| 2082 | 1.865 | 1.981 |
| 2083 | 1.87 | 1.981 |
| 2084 | 1.88 | 1.981 |
| 2085 | 1.875 | 1.981 |
| 2086 | 1.865 | 1.981 |
| 2087 | 1.87 | 1.981 |
| 2088 | 1.87 | 1.981 |
| 2089 | 1.875 | 1.981 |
| 2090 | 1.87 | 1.981 |
| 2091 | 1.86 | 1.981 |
| 2092 | 1.85 | 1.981 |
| 2093 | 1.83 | 1.981 |
| 2094 | 1.805 | 1.981 |
| 2095 | 1.81 | 1.981 |
| 2096 | 1.81 | 1.981 |
| 2097 | 1.805 | 1.981 |
| 2098 | 1.8 | 1.981 |
| 2099 | 1.8 | 1.981 |
| 2100 | 1.8 | 1.981 |
| 2101 | 1.805 | 1.981 |
| 2102 | 1.805 | 1.981 |
| 2103 | 1.805 | 1.981 |
| 2104 | 1.805 | 1.981 |
| 2105 | 1.805 | 1.981 |
| 2106 | 1.805 | 1.981 |
| 2107 | 1.805 | 1.981 |
| 2108 | 1.805 | 1.981 |
| 2109 | 1.805 | 1.981 |
| 2110 | 1.805 | 1.981 |
| 2111 | 1.81 | 1.981 |
| 2112 | 1.805 | 1.981 |
| 2113 | 1.81 | 1.981 |
| 2114 | 1.82 | 1.981 |
| 2115 | 1.815 | 1.981 |
| 2116 | 1.805 | 1.981 |
| 2117 | 1.805 | 1.981 |
| 2118 | 1.805 | 1.981 |
| 2119 | 1.815 | 1.981 |
| 2120 | 1.83 | 1.981 |
| 2121 | 1.825 | 1.981 |
| 2122 | 1.82 | 1.981 |
| 2123 | 1.82 | 1.981 |
| 2124 | 1.82 | 1.981 |
| 2125 | 1.81 | 1.981 |
| 2126 | 1.8 | 1.981 |
| 2127 | 1.81 | 1.981 |
| 2128 | 1.825 | 1.981 |
| 2129 | 1.825 | 1.981 |
| 2130 | 1.825 | 1.981 |
| 2131 | 1.835 | 1.981 |
| 2132 | 1.83 | 1.981 |
| 2133 | 1.825 | 1.981 |
| 2134 | 1.81 | 1.981 |
| 2135 | 1.81 | 1.981 |
| 2136 | 1.81 | 1.981 |
| 2137 | 1.81 | 1.981 |
| 2138 | 1.795 | 1.981 |
| 2139 | 1.795 | 1.981 |
| 2140 | 1.795 | 1.981 |
| 2141 | 1.795 | 1.981 |
| 2142 | 1.78 | 1.981 |
| 2143 | 1.78 | 1.981 |
| 2144 | 1.785 | 1.981 |
| 2145 | 1.78 | 1.981 |
| 2146 | 1.785 | 1.981 |
| 2147 | 1.785 | 1.981 |
| 2148 | 1.78 | 1.981 |
| 2149 | 1.77 | 1.981 |
| 2150 | 1.76 | 1.981 |
| 2151 | 1.74 | 1.981 |
| 2152 | 1.745 | 1.981 |
| 2153 | 1.755 | 1.981 |
| 2154 | 1.75 | 1.981 |
| 2155 | 1.75 | 1.981 |
| 2156 | 1.75 | 1.981 |
| 2157 | 1.745 | 1.981 |
| 2158 | 1.735 | 1.981 |
| 2159 | 1.72 | 1.981 |
| 2160 | 1.7 | 1.981 |
| 2161 | 1.7 | 1.981 |
| 2162 | 1.705 | 1.981 |
| 2163 | 1.705 | 1.981 |
| 2164 | 1.705 | 1.981 |
| 2165 | 1.715 | 1.981 |
| 2166 | 1.71 | 1.981 |
| 2167 | 1.715 | 1.981 |
| 2168 | 1.715 | 1.981 |
| 2169 | 1.71 | 1.981 |
| 2170 | 1.715 | 1.981 |
| 2171 | 1.72 | 1.981 |
| 2172 | 1.72 | 1.981 |
| 2173 | 1.715 | 1.981 |
| 2174 | 1.705 | 1.981 |
| 2175 | 1.695 | 1.981 |
| 2176 | 1.705 | 1.981 |
| 2177 | 1.705 | 1.981 |
| 2178 | 1.705 | 1.981 |
| 2179 | 1.705 | 1.981 |
| 2180 | 1.705 | 1.981 |
| 2181 | 1.705 | 1.981 |
| 2182 | 1.695 | 1.981 |
| 2183 | 1.685 | 1.981 |
| 2184 | 1.685 | 1.981 |
| 2185 | 1.69 | 1.981 |
| 2186 | 1.695 | 1.981 |
| 2187 | 1.71 | 1.981 |
| 2188 | 1.73 | 1.981 |
| 2189 | 1.755 | 1.981 |
| 2190 | 1.785 | 1.981 |
| 2191 | 1.785 | 1.981 |
| 2192 | 1.79 | 1.981 |
| 2193 | 1.79 | 1.981 |
| 2194 | 1.79 | 1.981 |
| 2195 | 1.78 | 1.981 |
| 2196 | 1.78 | 1.981 |
| 2197 | 1.775 | 1.981 |
| 2198 | 1.77 | 1.981 |
| 2199 | 1.77 | 1.981 |
| 2200 | 1.77 | 1.981 |
| 2201 | 1.76 | 1.981 |
| 2202 | 1.75 | 1.981 |
| 2203 | 1.75 | 1.981 |
| 2204 | 1.755 | 1.981 |
| 2205 | 1.755 | 1.981 |
| 2206 | 1.75 | 1.981 |
| 2207 | 1.745 | 1.981 |
| 2208 | 1.755 | 1.981 |
| 2209 | 1.77 | 1.981 |
| 2210 | 1.79 | 1.981 |
| 2211 | 1.81 | 1.981 |
| 2212 | 1.83 | 1.981 |
| 2213 | 1.85 | 1.981 |
| 2214 | 1.85 | 1.981 |
| 2215 | 1.845 | 1.981 |
| 2216 | 1.84 | 1.981 |
| 2217 | 1.825 | 1.981 |
| 2218 | 1.83 | 1.981 |
| 2219 | 1.84 | 1.981 |
| 2220 | 1.835 | 1.981 |
| 2221 | 1.83 | 1.981 |
| 2222 | 1.84 | 1.981 |
| 2223 | 1.85 | 1.981 |
| 2224 | 1.87 | 1.981 |
| 2225 | 1.87 | 1.981 |
| 2226 | 1.87 | 1.981 |
| 2227 | 1.865 | 1.981 |
| 2228 | 1.86 | 1.981 |
| 2229 | 1.845 | 1.981 |
| 2230 | 1.825 | 1.981 |
| 2231 | 1.8 | 1.981 |
| 2232 | 1.805 | 1.981 |
| 2233 | 1.805 | 1.981 |
| 2234 | 1.805 | 1.981 |
| 2235 | 1.805 | 1.981 |
| 2236 | 1.815 | 1.981 |
| 2237 | 1.815 | 1.981 |
| 2238 | 1.81 | 1.981 |
| 2239 | 1.815 | 1.981 |
| 2240 | 1.82 | 1.981 |
| 2241 | 1.825 | 1.981 |
| 2242 | 1.845 | 1.981 |
| 2243 | 1.84 | 1.981 |
| 2244 | 1.835 | 1.981 |
| 2245 | 1.835 | 1.981 |
| 2246 | 1.835 | 1.981 |
| 2247 | 1.835 | 1.981 |
| 2248 | 1.835 | 1.981 |
| 2249 | 1.825 | 1.981 |
| 2250 | 1.83 | 1.981 |
| 2251 | 1.83 | 1.981 |
| 2252 | 1.83 | 1.981 |
| 2253 | 1.83 | 1.981 |
| 2254 | 1.82 | 1.981 |
| 2255 | 1.81 | 1.981 |
| 2256 | 1.82 | 1.981 |
| 2257 | 1.815 | 1.981 |
| 2258 | 1.805 | 1.981 |
| 2259 | 1.805 | 1.981 |
| 2260 | 1.8 | 1.981 |
| 2261 | 1.805 | 1.981 |
| 2262 | 1.8 | 1.981 |
| 2263 | 1.79 | 1.981 |
| 2264 | 1.795 | 1.981 |
| 2265 | 1.795 | 1.981 |
| 2266 | 1.795 | 1.981 |
| 2267 | 1.8 | 1.981 |
| 2268 | 1.795 | 1.981 |
| 2269 | 1.8 | 1.981 |
| 2270 | 1.81 | 1.981 |
| 2271 | 1.81 | 1.981 |
| 2272 | 1.805 | 1.981 |
| 2273 | 1.795 | 1.981 |
| 2274 | 1.795 | 1.981 |
| 2275 | 1.79 | 1.981 |
| 2276 | 1.785 | 1.981 |
| 2277 | 1.785 | 1.981 |
| 2278 | 1.78 | 1.981 |
| 2279 | 1.78 | 1.981 |
| 2280 | 1.785 | 1.981 |
| 2281 | 1.78 | 1.981 |
| 2282 | 1.78 | 1.981 |
| 2283 | 1.775 | 1.981 |
| 2284 | 1.765 | 1.981 |
| 2285 | 1.77 | 1.981 |
| 2286 | 1.78 | 1.981 |
| 2287 | 1.79 | 1.981 |
| 2288 | 1.79 | 1.981 |
| 2289 | 1.79 | 1.981 |
| 2290 | 1.79 | 1.981 |
| 2291 | 1.795 | 1.981 |
| 2292 | 1.8 | 1.981 |
| 2293 | 1.815 | 1.981 |
| 2294 | 1.835 | 1.981 |
| 2295 | 1.855 | 1.981 |
| 2296 | 1.855 | 1.981 |
| 2297 | 1.86 | 1.981 |
| 2298 | 1.855 | 1.981 |
| 2299 | 1.855 | 1.981 |
| 2300 | 1.86 | 1.981 |
| 2301 | 1.855 | 1.981 |
| 2302 | 1.855 | 1.981 |
| 2303 | 1.855 | 1.981 |
| 2304 | 1.855 | 1.981 |
| 2305 | 1.855 | 1.981 |
| 2306 | 1.855 | 1.981 |
| 2307 | 1.86 | 1.981 |
| 2308 | 1.865 | 1.981 |
| 2309 | 1.88 | 1.981 |
| 2310 | 1.9 | 1.981 |
| 2311 | 1.895 | 1.981 |
| 2312 | 1.895 | 1.981 |
| 2313 | 1.895 | 1.981 |
| 2314 | 1.895 | 1.981 |
| 2315 | 1.895 | 1.981 |
| 2316 | 1.9 | 1.981 |
| 2317 | 1.91 | 1.981 |
| 2318 | 1.92 | 1.981 |
| 2319 | 1.91 | 1.981 |
| 2320 | 1.895 | 1.981 |
| 2321 | 1.9 | 1.981 |
| 2322 | 1.895 | 1.981 |
| 2323 | 1.9 | 1.981 |
| 2324 | 1.895 | 1.981 |
| 2325 | 1.895 | 1.981 |
| 2326 | 1.89 | 1.981 |
| 2327 | 1.885 | 1.981 |
| 2328 | 1.87 | 1.981 |
| 2329 | 1.875 | 1.981 |
| 2330 | 1.87 | 1.981 |
| 2331 | 1.865 | 1.981 |
| 2332 | 1.875 | 1.981 |
| 2333 | 1.885 | 1.981 |
| 2334 | 1.885 | 1.981 |
| 2335 | 1.89 | 1.981 |
| 2336 | 1.885 | 1.981 |
| 2337 | 1.88 | 1.981 |
| 2338 | 1.88 | 1.981 |
| 2339 | 1.885 | 1.981 |
| 2340 | 1.89 | 1.981 |
| 2341 | 1.88 | 1.981 |
| 2342 | 1.885 | 1.981 |
| 2343 | 1.885 | 1.981 |
| 2344 | 1.88 | 1.981 |
| 2345 | 1.885 | 1.981 |
| 2346 | 1.89 | 1.981 |
| 2347 | 1.905 | 1.981 |
| 2348 | 1.925 | 1.981 |
| 2349 | 1.925 | 1.981 |
| 2350 | 1.92 | 1.981 |
| 2351 | 1.925 | 1.981 |
| 2352 | 1.93 | 1.981 |
| 2353 | 1.935 | 1.981 |
| 2354 | 1.935 | 1.981 |
| 2355 | 1.935 | 1.981 |
| 2356 | 1.935 | 1.981 |
| 2357 | 1.935 | 1.981 |
| 2358 | 1.94 | 1.981 |
| 2359 | 1.94 | 1.981 |
| 2360 | 1.945 | 1.981 |
| 2361 | 1.945 | 1.981 |
| 2362 | 1.94 | 1.981 |
| 2363 | 1.94 | 1.981 |
| 2364 | 1.94 | 1.981 |
| 2365 | 1.93 | 1.981 |
| 2366 | 1.935 | 1.981 |
| 2367 | 1.94 | 1.981 |
| 2368 | 1.94 | 1.981 |
| 2369 | 1.94 | 1.981 |
| 2370 | 1.935 | 1.981 |
| 2371 | 1.93 | 1.981 |
| 2372 | 1.94 | 1.981 |
| 2373 | 1.955 | 1.981 |
| 2374 | 1.955 | 1.981 |
| 2375 | 1.95 | 1.981 |
| 2376 | 1.945 | 1.981 |
| 2377 | 1.945 | 1.981 |
| 2378 | 1.945 | 1.981 |
| 2379 | 1.945 | 1.981 |
| 2380 | 1.95 | 1.981 |
| 2381 | 1.955 | 1.981 |
| 2382 | 1.97 | 1.981 |
| 2383 | 1.985 | 1.981 |
| 2384 | 1.985 | 1.981 |
| 2385 | 1.98 | 1.981 |
| 2386 | 1.97 | 1.981 |
| 2387 | 1.955 | 1.981 |
| 2388 | 1.94 | 1.981 |
| 2389 | 1.915 | 1.981 |
| 2390 | 1.89 | 1.981 |
| 2391 | 1.9 | 1.981 |
| 2392 | 1.91 | 1.981 |
| 2393 | 1.91 | 1.981 |
| 2394 | 1.905 | 1.981 |
| 2395 | 1.905 | 1.981 |
| 2396 | 1.91 | 1.981 |
| 2397 | 1.92 | 1.981 |
| 2398 | 1.915 | 1.981 |
| 2399 | 1.92 | 1.981 |
| 2400 | 1.925 | 1.981 |
| 2401 | 1.94 | 1.981 |
| 2402 | 1.955 | 1.981 |
| 2403 | 1.98 | 1.981 |
| 2404 | 2.005 | 1.981 |
| 2405 | 2.04 | 1.981 |
| 2406 | 2.08 | 1.981 |
| 2407 | 2.12 | 1.981 |
| 2408 | 2.16 | 1.981 |
| 2409 | 2.2 | 1.981 |
| 2410 | 2.18 | 1.981 |
| 2411 | 2.16 | 1.981 |
| 2412 | 2.13 | 1.981 |
| 2413 | 2.095 | 1.981 |
| 2414 | 2.095 | 1.981 |
| 2415 | 2.095 | 1.981 |
| 2416 | 2.09 | 1.981 |
| 2417 | 2.09 | 1.981 |
| 2418 | 2.09 | 1.981 |
| 2419 | 2.09 | 1.981 |
| 2420 | 2.09 | 1.981 |
| 2421 | 2.085 | 1.981 |
| 2422 | 2.08 | 1.981 |
| 2423 | 2.065 | 1.981 |
| 2424 | 2.05 | 1.981 |
| 2425 | 2.05 | 1.981 |
| 2426 | 2.055 | 1.981 |
| 2427 | 2.055 | 1.981 |
| 2428 | 2.055 | 1.981 |
| 2429 | 2.065 | 1.981 |
| 2430 | 2.08 | 1.981 |
| 2431 | 2.08 | 1.981 |
| 2432 | 2.075 | 1.981 |
| 2433 | 2.075 | 1.981 |
| 2434 | 2.075 | 1.981 |
| 2435 | 2.075 | 1.981 |
| 2436 | 2.065 | 1.981 |
| 2437 | 2.07 | 1.981 |
| 2438 | 2.08 | 1.981 |
| 2439 | 2.075 | 1.981 |
| 2440 | 2.07 | 1.981 |
| 2441 | 2.065 | 1.981 |
| 2442 | 2.06 | 1.981 |
| 2443 | 2.08 | 1.981 |
| 2444 | 2.1 | 1.981 |
| 2445 | 2.13 | 1.981 |
| 2446 | 2.165 | 1.981 |
| 2447 | 2.205 | 1.981 |
| 2448 | 2.2 | 1.981 |
| 2449 | 2.2 | 1.981 |
| 2450 | 2.2 | 1.981 |
| 2451 | 2.21 | 1.981 |
| 2452 | 2.21 | 1.981 |
| 2453 | 2.21 | 1.981 |
| 2454 | 2.22 | 1.981 |
| 2455 | 2.215 | 1.981 |
| 2456 | 2.205 | 1.981 |
| 2457 | 2.205 | 1.981 |
| 2458 | 2.205 | 1.981 |
| 2459 | 2.21 | 1.981 |
| 2460 | 2.21 | 1.981 |
| 2461 | 2.21 | 1.981 |
| 2462 | 2.22 | 1.981 |
| 2463 | 2.235 | 1.981 |
| 2464 | 2.25 | 1.981 |
| 2465 | 2.275 | 1.981 |
| 2466 | 2.305 | 1.981 |
| 2467 | 2.335 | 1.981 |
| 2468 | 2.335 | 1.981 |
| 2469 | 2.335 | 1.981 |
| 2470 | 2.325 | 1.981 |
| 2471 | 2.33 | 1.981 |
| 2472 | 2.33 | 1.981 |
| 2473 | 2.33 | 1.981 |
| 2474 | 2.33 | 1.981 |
| 2475 | 2.335 | 1.981 |
| 2476 | 2.34 | 1.981 |
| 2477 | 2.355 | 1.981 |
| 2478 | 2.355 | 1.981 |
| 2479 | 2.355 | 1.981 |
| 2480 | 2.35 | 1.981 |
| 2481 | 2.355 | 1.981 |
| 2482 | 2.365 | 1.981 |
| 2483 | 2.38 | 1.981 |
| 2484 | 2.4 | 1.981 |
| 2485 | 2.42 | 1.981 |
| 2486 | 2.44 | 1.981 |
| 2487 | 2.46 | 1.981 |
| 2488 | 2.46 | 1.981 |
| 2489 | 2.455 | 1.981 |
| 2490 | 2.46 | 1.981 |
| 2491 | 2.465 | 1.981 |
| 2492 | 2.455 | 1.981 |
| 2493 | 2.445 | 1.981 |
| 2494 | 2.435 | 1.981 |
| 2495 | 2.41 | 1.981 |
| 2496 | 2.41 | 1.981 |
| 2497 | 2.405 | 1.981 |
| 2498 | 2.405 | 1.981 |
| 2499 | 2.405 | 1.981 |
| 2500 | 2.405 | 1.981 |
| 2501 | 2.415 | 1.981 |
| 2502 | 2.415 | 1.981 |
| 2503 | 2.415 | 1.981 |
| 2504 | 2.415 | 1.981 |
| 2505 | 2.42 | 1.981 |
| 2506 | 2.42 | 1.981 |
| 2507 | 2.42 | 1.981 |
| 2508 | 2.41 | 1.981 |
| 2509 | 2.395 | 1.981 |
| 2510 | 2.375 | 1.981 |
| 2511 | 2.375 | 1.981 |
| 2512 | 2.375 | 1.981 |
| 2513 | 2.37 | 1.981 |
| 2514 | 2.365 | 1.981 |
| 2515 | 2.375 | 1.981 |
| 2516 | 2.385 | 1.981 |
| 2517 | 2.395 | 1.981 |
| 2518 | 2.405 | 1.981 |
| 2519 | 2.405 | 1.981 |
| 2520 | 2.405 | 1.981 |
| 2521 | 2.4 | 1.981 |
| 2522 | 2.4 | 1.981 |
| 2523 | 2.395 | 1.981 |
| 2524 | 2.4 | 1.981 |
| 2525 | 2.4 | 1.981 |
| 2526 | 2.405 | 1.981 |
| 2527 | 2.4 | 1.981 |
| 2528 | 2.405 | 1.981 |
| 2529 | 2.4 | 1.981 |
| 2530 | 2.405 | 1.981 |
| 2531 | 2.4 | 1.981 |
| 2532 | 2.39 | 1.981 |
| 2533 | 2.375 | 1.981 |
| 2534 | 2.38 | 1.981 |
| 2535 | 2.385 | 1.981 |
| 2536 | 2.385 | 1.981 |
| 2537 | 2.385 | 1.981 |
| 2538 | 2.395 | 1.981 |
| 2539 | 2.39 | 1.981 |
| 2540 | 2.385 | 1.981 |
| 2541 | 2.385 | 1.981 |
| 2542 | 2.385 | 1.981 |
| 2543 | 2.395 | 1.981 |
| 2544 | 2.395 | 1.981 |
| 2545 | 2.39 | 1.981 |
| 2546 | 2.38 | 1.981 |
| 2547 | 2.365 | 1.981 |
| 2548 | 2.345 | 1.981 |
| 2549 | 2.345 | 1.981 |
| 2550 | 2.35 | 1.981 |
| 2551 | 2.355 | 1.981 |
| 2552 | 2.36 | 1.981 |
| 2553 | 2.365 | 1.981 |
| 2554 | 2.365 | 1.981 |
| 2555 | 2.37 | 1.981 |
| 2556 | 2.38 | 1.981 |
| 2557 | 2.38 | 1.981 |
| 2558 | 2.375 | 1.981 |
| 2559 | 2.375 | 1.981 |
| 2560 | 2.375 | 1.981 |
| 2561 | 2.385 | 1.981 |
| 2562 | 2.4 | 1.981 |
| 2563 | 2.42 | 1.981 |
| 2564 | 2.44 | 1.981 |
| 2565 | 2.47 | 1.981 |
| 2566 | 2.5 | 1.981 |
| 2567 | 2.53 | 1.981 |
| 2568 | 2.575 | 1.981 |
| 2569 | 2.625 | 1.981 |
| 2570 | 2.625 | 1.981 |
| 2571 | 2.62 | 1.981 |
| 2572 | 2.615 | 1.981 |
| 2573 | 2.61 | 1.981 |
| 2574 | 2.61 | 1.981 |
| 2575 | 2.61 | 1.981 |
| 2576 | 2.61 | 1.981 |
| 2577 | 2.61 | 1.981 |
| 2578 | 2.615 | 1.981 |
| 2579 | 2.615 | 1.981 |
| 2580 | 2.615 | 1.981 |
| 2581 | 2.615 | 1.981 |
| 2582 | 2.6 | 1.981 |
| 2583 | 2.585 | 1.981 |
| 2584 | 2.585 | 1.981 |
| 2585 | 2.59 | 1.981 |
| 2586 | 2.59 | 1.981 |
| 2587 | 2.59 | 1.981 |
| 2588 | 2.59 | 1.981 |
| 2589 | 2.6 | 1.981 |
| 2590 | 2.61 | 1.981 |
| 2591 | 2.62 | 1.981 |
| 2592 | 2.63 | 1.981 |
| 2593 | 2.63 | 1.981 |
| 2594 | 2.635 | 1.981 |
| 2595 | 2.635 | 1.981 |
| 2596 | 2.635 | 1.981 |
| 2597 | 2.635 | 1.981 |
| 2598 | 2.65 | 1.981 |
| 2599 | 2.645 | 1.981 |
| 2600 | 2.64 | 1.981 |
| 2601 | 2.625 | 1.981 |
| 2602 | 2.61 | 1.981 |
| 2603 | 2.585 | 1.981 |
| 2604 | 2.555 | 1.981 |
| 2605 | 2.52 | 1.981 |
| 2606 | 2.485 | 1.981 |
| 2607 | 2.45 | 1.981 |
| 2608 | 2.415 | 1.981 |
| 2609 | 2.36 | 1.981 |
| 2610 | 2.36 | 1.981 |
| 2611 | 2.355 | 1.981 |
| 2612 | 2.355 | 1.981 |
| 2613 | 2.36 | 1.981 |
| 2614 | 2.36 | 1.981 |
| 2615 | 2.36 | 1.981 |
| 2616 | 2.365 | 1.981 |
| 2617 | 2.375 | 1.981 |
| 2618 | 2.37 | 1.981 |
| 2619 | 2.36 | 1.981 |
| 2620 | 2.36 | 1.981 |
| 2621 | 2.36 | 1.981 |
| 2622 | 2.355 | 1.981 |
| 2623 | 2.355 | 1.981 |
| 2624 | 2.355 | 1.981 |
| 2625 | 2.355 | 1.981 |
| 2626 | 2.355 | 1.981 |
| 2627 | 2.355 | 1.981 |
| 2628 | 2.355 | 1.981 |
| 2629 | 2.355 | 1.981 |
| 2630 | 2.355 | 1.981 |
| 2631 | 2.355 | 1.981 |
| 2632 | 2.36 | 1.981 |
| 2633 | 2.36 | 1.981 |
| 2634 | 2.36 | 1.981 |
| 2635 | 2.36 | 1.981 |
| 2636 | 2.37 | 1.981 |
| 2637 | 2.365 | 1.981 |
| 2638 | 2.36 | 1.981 |
| 2639 | 2.37 | 1.981 |
| 2640 | 2.38 | 1.981 |
| 2641 | 2.39 | 1.981 |
| 2642 | 2.375 | 1.981 |
| 2643 | 2.355 | 1.981 |
| 2644 | 2.335 | 1.981 |
| 2645 | 2.315 | 1.981 |
| 2646 | 2.295 | 1.981 |
| 2647 | 2.275 | 1.981 |
| 2648 | 2.275 | 1.981 |
| 2649 | 2.28 | 1.981 |
| 2650 | 2.285 | 1.981 |
| 2651 | 2.29 | 1.981 |
| 2652 | 2.31 | 1.981 |
| 2653 | 2.33 | 1.981 |
| 2654 | 2.35 | 1.981 |
| 2655 | 2.385 | 1.981 |
| 2656 | 2.385 | 1.981 |
| 2657 | 2.385 | 1.981 |
| 2658 | 2.39 | 1.981 |
| 2659 | 2.385 | 1.981 |
| 2660 | 2.385 | 1.981 |
| 2661 | 2.385 | 1.981 |
| 2662 | 2.385 | 1.981 |
| 2663 | 2.37 | 1.981 |
| 2664 | 2.355 | 1.981 |
| 2665 | 2.34 | 1.981 |
| 2666 | 2.31 | 1.981 |
| 2667 | 2.28 | 1.981 |
| 2668 | 2.28 | 1.981 |
| 2669 | 2.275 | 1.981 |
| 2670 | 2.275 | 1.981 |
| 2671 | 2.275 | 1.981 |
| 2672 | 2.275 | 1.981 |
| 2673 | 2.275 | 1.981 |
| 2674 | 2.28 | 1.981 |
| 2675 | 2.285 | 1.981 |
| 2676 | 2.29 | 1.981 |
| 2677 | 2.275 | 1.981 |
| 2678 | 2.28 | 1.981 |
| 2679 | 2.29 | 1.981 |
| 2680 | 2.29 | 1.981 |
| 2681 | 2.285 | 1.981 |
| 2682 | 2.275 | 1.981 |
| 2683 | 2.265 | 1.981 |
| 2684 | 2.245 | 1.981 |
| 2685 | 2.22 | 1.981 |
| 2686 | 2.19 | 1.981 |
| 2687 | 2.155 | 1.981 |
| 2688 | 2.16 | 1.981 |
| 2689 | 2.16 | 1.981 |
| 2690 | 2.16 | 1.981 |
| 2691 | 2.16 | 1.981 |
| 2692 | 2.16 | 1.981 |
| 2693 | 2.155 | 1.981 |
| 2694 | 2.15 | 1.981 |
| 2695 | 2.16 | 1.981 |
| 2696 | 2.175 | 1.981 |
| 2697 | 2.195 | 1.981 |
| 2698 | 2.22 | 1.981 |
| 2699 | 2.25 | 1.981 |
| 2700 | 2.28 | 1.981 |
| 2701 | 2.31 | 1.981 |
| 2702 | 2.31 | 1.981 |
| 2703 | 2.315 | 1.981 |
| 2704 | 2.325 | 1.981 |
| 2705 | 2.32 | 1.981 |
| 2706 | 2.32 | 1.981 |
| 2707 | 2.32 | 1.981 |
| 2708 | 2.33 | 1.981 |
| 2709 | 2.345 | 1.981 |
| 2710 | 2.365 | 1.981 |
| 2711 | 2.39 | 1.981 |
| 2712 | 2.39 | 1.981 |
| 2713 | 2.39 | 1.981 |
| 2714 | 2.385 | 1.981 |
| 2715 | 2.38 | 1.981 |
| 2716 | 2.375 | 1.981 |
| 2717 | 2.37 | 1.981 |
| 2718 | 2.365 | 1.981 |
| 2719 | 2.365 | 1.981 |
| 2720 | 2.365 | 1.981 |
| 2721 | 2.365 | 1.981 |
| 2722 | 2.37 | 1.981 |
| 2723 | 2.37 | 1.981 |
| 2724 | 2.37 | 1.981 |
| 2725 | 2.38 | 1.981 |
| 2726 | 2.39 | 1.981 |
| 2727 | 2.41 | 1.981 |
| 2728 | 2.43 | 1.981 |
| 2729 | 2.46 | 1.981 |
| 2730 | 2.455 | 1.981 |
| 2731 | 2.455 | 1.981 |
| 2732 | 2.46 | 1.981 |
| 2733 | 2.47 | 1.981 |
| 2734 | 2.48 | 1.981 |
| 2735 | 2.47 | 1.981 |
| 2736 | 2.47 | 1.981 |
| 2737 | 2.465 | 1.981 |
| 2738 | 2.455 | 1.981 |
| 2739 | 2.455 | 1.981 |
| 2740 | 2.455 | 1.981 |
| 2741 | 2.465 | 1.981 |
| 2742 | 2.475 | 1.981 |
| 2743 | 2.465 | 1.981 |
| 2744 | 2.47 | 1.981 |
| 2745 | 2.48 | 1.981 |
| 2746 | 2.495 | 1.981 |
| 2747 | 2.495 | 1.981 |
| 2748 | 2.495 | 1.981 |
| 2749 | 2.495 | 1.981 |
| 2750 | 2.495 | 1.981 |
| 2751 | 2.495 | 1.981 |
| 2752 | 2.48 | 1.981 |
| 2753 | 2.465 | 1.981 |
| 2754 | 2.475 | 1.981 |
| 2755 | 2.47 | 1.981 |
| 2756 | 2.46 | 1.981 |
| 2757 | 2.465 | 1.981 |
| 2758 | 2.475 | 1.981 |
| 2759 | 2.49 | 1.981 |
| 2760 | 2.485 | 1.981 |
| 2761 | 2.475 | 1.981 |
| 2762 | 2.46 | 1.981 |
| 2763 | 2.44 | 1.981 |
| 2764 | 2.42 | 1.981 |
| 2765 | 2.4 | 1.981 |
| 2766 | 2.38 | 1.981 |
| 2767 | 2.34 | 1.981 |
| 2768 | 2.3 | 1.981 |
| 2769 | 2.25 | 1.981 |
| 2770 | 2.25 | 1.981 |
| 2771 | 2.25 | 1.981 |
| 2772 | 2.245 | 1.981 |
| 2773 | 2.24 | 1.981 |
| 2774 | 2.24 | 1.981 |
| 2775 | 2.24 | 1.981 |
| 2776 | 2.235 | 1.981 |
| 2777 | 2.24 | 1.981 |
| 2778 | 2.235 | 1.981 |
| 2779 | 2.235 | 1.981 |
| 2780 | 2.235 | 1.981 |
| 2781 | 2.235 | 1.981 |
| 2782 | 2.25 | 1.981 |
| 2783 | 2.265 | 1.981 |
| 2784 | 2.29 | 1.981 |
| 2785 | 2.285 | 1.981 |
| 2786 | 2.29 | 1.981 |
| 2787 | 2.3 | 1.981 |
| 2788 | 2.295 | 1.981 |
| 2789 | 2.29 | 1.981 |
| 2790 | 2.285 | 1.981 |
| 2791 | 2.28 | 1.981 |
| 2792 | 2.255 | 1.981 |
| 2793 | 2.255 | 1.981 |
| 2794 | 2.255 | 1.981 |
| 2795 | 2.255 | 1.981 |
| 2796 | 2.25 | 1.981 |
| 2797 | 2.245 | 1.981 |
| 2798 | 2.24 | 1.981 |
| 2799 | 2.255 | 1.981 |
| 2800 | 2.25 | 1.981 |
| 2801 | 2.25 | 1.981 |
| 2802 | 2.25 | 1.981 |
| 2803 | 2.26 | 1.981 |
| 2804 | 2.26 | 1.981 |
| 2805 | 2.26 | 1.981 |
| 2806 | 2.255 | 1.981 |
| 2807 | 2.25 | 1.981 |
| 2808 | 2.245 | 1.981 |
| 2809 | 2.26 | 1.981 |
| 2810 | 2.26 | 1.981 |
| 2811 | 2.265 | 1.981 |
| 2812 | 2.275 | 1.981 |
| 2813 | 2.27 | 1.981 |
| 2814 | 2.27 | 1.981 |
| 2815 | 2.275 | 1.981 |
| 2816 | 2.27 | 1.981 |
| 2817 | 2.265 | 1.981 |
| 2818 | 2.265 | 1.981 |
| 2819 | 2.265 | 1.981 |
| 2820 | 2.27 | 1.981 |
| 2821 | 2.27 | 1.981 |
| 2822 | 2.27 | 1.981 |
| 2823 | 2.275 | 1.981 |
| 2824 | 2.28 | 1.981 |
| 2825 | 2.28 | 1.981 |
| 2826 | 2.275 | 1.981 |
| 2827 | 2.275 | 1.981 |
| 2828 | 2.27 | 1.981 |
| 2829 | 2.26 | 1.981 |
| 2830 | 2.25 | 1.981 |
| 2831 | 2.26 | 1.981 |
| 2832 | 2.255 | 1.981 |
| 2833 | 2.255 | 1.981 |
| 2834 | 2.26 | 1.981 |
| 2835 | 2.265 | 1.981 |
| 2836 | 2.27 | 1.981 |
| 2837 | 2.27 | 1.981 |
| 2838 | 2.27 | 1.981 |
| 2839 | 2.26 | 1.981 |
| 2840 | 2.245 | 1.981 |
| 2841 | 2.23 | 1.981 |
| 2842 | 2.24 | 1.981 |
| 2843 | 2.255 | 1.981 |
| 2844 | 2.25 | 1.981 |
| 2845 | 2.24 | 1.981 |
| 2846 | 2.23 | 1.981 |
| 2847 | 2.22 | 1.981 |
| 2848 | 2.22 | 1.981 |
| 2849 | 2.22 | 1.981 |
| 2850 | 2.22 | 1.981 |
| 2851 | 2.22 | 1.981 |
| 2852 | 2.22 | 1.981 |
| 2853 | 2.22 | 1.981 |
| 2854 | 2.19 | 1.981 |
| 2855 | 2.16 | 1.981 |
| 2856 | 2.17 | 1.981 |
| 2857 | 2.185 | 1.981 |
| 2858 | 2.2 | 1.981 |
| 2859 | 2.225 | 1.981 |
| 2860 | 2.225 | 1.981 |
| 2861 | 2.225 | 1.981 |
| 2862 | 2.225 | 1.981 |
| 2863 | 2.225 | 1.981 |
| 2864 | 2.22 | 1.981 |
| 2865 | 2.21 | 1.981 |
| 2866 | 2.215 | 1.981 |
| 2867 | 2.21 | 1.981 |
| 2868 | 2.215 | 1.981 |
| 2869 | 2.225 | 1.981 |
| 2870 | 2.225 | 1.981 |
| 2871 | 2.225 | 1.981 |
| 2872 | 2.235 | 1.981 |
| 2873 | 2.235 | 1.981 |
| 2874 | 2.235 | 1.981 |
| 2875 | 2.235 | 1.981 |
| 2876 | 2.235 | 1.981 |
| 2877 | 2.235 | 1.981 |
| 2878 | 2.23 | 1.981 |
| 2879 | 2.22 | 1.981 |
| 2880 | 2.225 | 1.981 |
| 2881 | 2.235 | 1.981 |
| 2882 | 2.25 | 1.981 |
| 2883 | 2.245 | 1.981 |
| 2884 | 2.245 | 1.981 |
| 2885 | 2.25 | 1.981 |
| 2886 | 2.25 | 1.981 |
| 2887 | 2.25 | 1.981 |
| 2888 | 2.25 | 1.981 |
| 2889 | 2.26 | 1.981 |
| 2890 | 2.255 | 1.981 |
| 2891 | 2.25 | 1.981 |
| 2892 | 2.25 | 1.981 |
| 2893 | 2.25 | 1.981 |
| 2894 | 2.245 | 1.981 |
| 2895 | 2.235 | 1.981 |
| 2896 | 2.225 | 1.981 |
| 2897 | 2.215 | 1.981 |
| 2898 | 2.205 | 1.981 |
| 2899 | 2.195 | 1.981 |
| 2900 | 2.185 | 1.981 |
| 2901 | 2.175 | 1.981 |
| 2902 | 2.21 | 1.981 |
| 2903 | 2.205 | 1.981 |
| 2904 | 2.2 | 1.981 |
| 2905 | 2.21 | 1.981 |
| 2906 | 2.21 | 1.981 |
| 2907 | 2.205 | 1.981 |
| 2908 | 2.195 | 1.981 |
| 2909 | 2.18 | 1.981 |
| 2910 | 2.16 | 1.981 |
| 2911 | 2.135 | 1.981 |
| 2912 | 2.135 | 1.981 |
| 2913 | 2.14 | 1.981 |
| 2914 | 2.14 | 1.981 |
| 2915 | 2.135 | 1.981 |
| 2916 | 2.125 | 1.981 |
| 2917 | 2.11 | 1.981 |
| 2918 | 2.09 | 1.981 |
| 2919 | 2.095 | 1.981 |
| 2920 | 2.105 | 1.981 |
| 2921 | 2.105 | 1.981 |
| 2922 | 2.1 | 1.981 |
| 2923 | 2.105 | 1.981 |
| 2924 | 2.11 | 1.981 |
| 2925 | 2.1 | 1.981 |
| 2926 | 2.085 | 1.981 |
| 2927 | 2.065 | 1.981 |
| 2928 | 2.045 | 1.981 |
| 2929 | 2.025 | 1.981 |
| 2930 | 2.025 | 1.981 |
| 2931 | 2.03 | 1.981 |
| 2932 | 2.035 | 1.981 |
| 2933 | 2.04 | 1.981 |
| 2934 | 2.025 | 1.981 |
| 2935 | 2.03 | 1.981 |
| 2936 | 2.04 | 1.981 |
| 2937 | 2.04 | 1.981 |
| 2938 | 2.04 | 1.981 |
| 2939 | 2.045 | 1.981 |
| 2940 | 2.05 | 1.981 |
| 2941 | 2.055 | 1.981 |
| 2942 | 2.04 | 1.981 |
| 2943 | 2.045 | 1.981 |
| 2944 | 2.04 | 1.981 |
| 2945 | 2.035 | 1.981 |
| 2946 | 2.02 | 1.981 |
| 2947 | 2.025 | 1.981 |
| 2948 | 2.025 | 1.981 |
| 2949 | 2.03 | 1.981 |
| 2950 | 2.035 | 1.981 |
| 2951 | 2.04 | 1.981 |
| 2952 | 2.06 | 1.981 |
| 2953 | 2.08 | 1.981 |
| 2954 | 2.07 | 1.981 |
| 2955 | 2.075 | 1.981 |
| 2956 | 2.085 | 1.981 |
| 2957 | 2.08 | 1.981 |
| 2958 | 2.075 | 1.981 |
| 2959 | 2.07 | 1.981 |
| 2960 | 2.07 | 1.981 |
| 2961 | 2.075 | 1.981 |
| 2962 | 2.085 | 1.981 |
| 2963 | 2.1 | 1.981 |
| 2964 | 2.095 | 1.981 |
| 2965 | 2.09 | 1.981 |
| 2966 | 2.085 | 1.981 |
| 2967 | 2.085 | 1.981 |
| 2968 | 2.08 | 1.981 |
| 2969 | 2.085 | 1.981 |
| 2970 | 2.095 | 1.981 |
| 2971 | 2.11 | 1.981 |
| 2972 | 2.13 | 1.981 |
| 2973 | 2.125 | 1.981 |
| 2974 | 2.125 | 1.981 |
| 2975 | 2.125 | 1.981 |
| 2976 | 2.13 | 1.981 |
| 2977 | 2.125 | 1.981 |
| 2978 | 2.13 | 1.981 |
| 2979 | 2.13 | 1.981 |
| 2980 | 2.13 | 1.981 |
| 2981 | 2.12 | 1.981 |
| 2982 | 2.11 | 1.981 |
| 2983 | 2.09 | 1.981 |
| 2984 | 2.07 | 1.981 |
| 2985 | 2.07 | 1.981 |
| 2986 | 2.07 | 1.981 |
| 2987 | 2.06 | 1.981 |
| 2988 | 2.06 | 1.981 |
| 2989 | 2.06 | 1.981 |
| 2990 | 2.05 | 1.981 |
| 2991 | 2.04 | 1.981 |
| 2992 | 2.04 | 1.981 |
| 2993 | 2.04 | 1.981 |
| 2994 | 2.035 | 1.981 |
| 2995 | 2.035 | 1.981 |
| 2996 | 2.04 | 1.981 |
| 2997 | 2.045 | 1.981 |
| 2998 | 2.05 | 1.981 |
| 2999 | 2.035 | 1.981 |
| 3000 | 2.035 | 1.981 |
| 3001 | 2.04 | 1.981 |
| 3002 | 2.035 | 1.981 |
| 3003 | 2.025 | 1.981 |
| 3004 | 2.025 | 1.981 |
| 3005 | 2.03 | 1.981 |
| 3006 | 2.03 | 1.981 |
| 3007 | 2.025 | 1.981 |
| 3008 | 2.015 | 1.981 |
| 3009 | 2.005 | 1.981 |
| 3010 | 2.015 | 1.981 |
| 3011 | 2.01 | 1.981 |
| 3012 | 2 | 1.981 |
| 3013 | 2.005 | 1.981 |
| 3014 | 2.015 | 1.981 |
| 3015 | 2.025 | 1.981 |
| 3016 | 2.025 | 1.981 |
| 3017 | 2.02 | 1.981 |
| 3018 | 2.02 | 1.981 |
| 3019 | 2.02 | 1.981 |
| 3020 | 2.015 | 1.981 |
| 3021 | 2.02 | 1.981 |
| 3022 | 2.03 | 1.981 |
| 3023 | 2.025 | 1.981 |
| 3024 | 2.015 | 1.981 |
| 3025 | 2.015 | 1.981 |
| 3026 | 2.015 | 1.981 |
| 3027 | 2.02 | 1.981 |
| 3028 | 2.03 | 1.981 |
| 3029 | 2.045 | 1.981 |
| 3030 | 2.04 | 1.981 |
| 3031 | 2.03 | 1.981 |
| 3032 | 2.035 | 1.981 |
| 3033 | 2.045 | 1.981 |
| 3034 | 2.04 | 1.981 |
| 3035 | 2.03 | 1.981 |
| 3036 | 2.02 | 1.981 |
| 3037 | 2.03 | 1.981 |
| 3038 | 2.025 | 1.981 |
| 3039 | 2.025 | 1.981 |
| 3040 | 2.025 | 1.981 |
| 3041 | 2.02 | 1.981 |
| 3042 | 2.01 | 1.981 |
| 3043 | 1.995 | 1.981 |
| 3044 | 2 | 1.981 |
| 3045 | 2.01 | 1.981 |
| 3046 | 2.02 | 1.981 |
| 3047 | 2.03 | 1.981 |
| 3048 | 2.055 | 1.981 |
| 3049 | 2.05 | 1.981 |
| 3050 | 2.04 | 1.981 |
| 3051 | 2.03 | 1.981 |
| 3052 | 2.02 | 1.981 |
| 3053 | 1.995 | 1.981 |
| 3054 | 1.995 | 1.981 |
| 3055 | 1.995 | 1.981 |
| 3056 | 1.985 | 1.981 |
| 3057 | 1.97 | 1.981 |
| 3058 | 1.95 | 1.981 |
| 3059 | 1.925 | 1.981 |
| 3060 | 1.925 | 1.981 |
| 3061 | 1.92 | 1.981 |
| 3062 | 1.915 | 1.981 |
| 3063 | 1.925 | 1.981 |
| 3064 | 1.94 | 1.981 |
| 3065 | 1.94 | 1.981 |
| 3066 | 1.935 | 1.981 |
| 3067 | 1.935 | 1.981 |
| 3068 | 1.935 | 1.981 |
| 3069 | 1.935 | 1.981 |
| 3070 | 1.935 | 1.981 |
| 3071 | 1.935 | 1.981 |
| 3072 | 1.935 | 1.981 |
| 3073 | 1.95 | 1.981 |
| 3074 | 1.965 | 1.981 |
| 3075 | 1.98 | 1.981 |
| 3076 | 1.995 | 1.981 |
| 3077 | 1.995 | 1.981 |
| 3078 | 1.995 | 1.981 |
| 3079 | 2 | 1.981 |
| 3080 | 2.005 | 1.981 |
| 3081 | 1.995 | 1.981 |
| 3082 | 1.985 | 1.981 |
| 3083 | 1.985 | 1.981 |
| 3084 | 1.99 | 1.981 |
| 3085 | 1.985 | 1.981 |
| 3086 | 1.99 | 1.981 |
| 3087 | 2 | 1.981 |
| 3088 | 1.995 | 1.981 |
| 3089 | 1.985 | 1.981 |
| 3090 | 1.99 | 1.981 |
| 3091 | 1.985 | 1.981 |
| 3092 | 1.985 | 1.981 |
| 3093 | 1.99 | 1.981 |
| 3094 | 1.99 | 1.981 |
| 3095 | 1.995 | 1.981 |
| 3096 | 1.99 | 1.981 |
| 3097 | 1.985 | 1.981 |
| 3098 | 1.97 | 1.981 |
| 3099 | 1.95 | 1.981 |
| 3100 | 1.93 | 1.981 |
| 3101 | 1.91 | 1.981 |
| 3102 | 1.89 | 1.981 |
| 3103 | 1.91 | 1.981 |
| 3104 | 1.905 | 1.981 |
| 3105 | 1.9 | 1.981 |
| 3106 | 1.91 | 1.981 |
| 3107 | 1.91 | 1.981 |
| 3108 | 1.91 | 1.981 |
| 3109 | 1.915 | 1.981 |
| 3110 | 1.915 | 1.981 |
| 3111 | 1.92 | 1.981 |
| 3112 | 1.92 | 1.981 |
| 3113 | 1.915 | 1.981 |
| 3114 | 1.92 | 1.981 |
| 3115 | 1.93 | 1.981 |
| 3116 | 1.945 | 1.981 |
| 3117 | 1.965 | 1.981 |
| 3118 | 1.99 | 1.981 |
| 3119 | 2.015 | 1.981 |
| 3120 | 2.04 | 1.981 |
| 3121 | 2.08 | 1.981 |
| 3122 | 2.08 | 1.981 |
| 3123 | 2.075 | 1.981 |
| 3124 | 2.065 | 1.981 |
| 3125 | 2.065 | 1.981 |
| 3126 | 2.07 | 1.981 |
| 3127 | 2.07 | 1.981 |
| 3128 | 2.065 | 1.981 |
| 3129 | 2.06 | 1.981 |
| 3130 | 2.07 | 1.981 |
| 3131 | 2.065 | 1.981 |
| 3132 | 2.06 | 1.981 |
| 3133 | 2.055 | 1.981 |
| 3134 | 2.055 | 1.981 |
| 3135 | 2.05 | 1.981 |
| 3136 | 2.04 | 1.981 |
| 3137 | 2.04 | 1.981 |
| 3138 | 2.04 | 1.981 |
| 3139 | 2.035 | 1.981 |
| 3140 | 2.03 | 1.981 |
| 3141 | 2.025 | 1.981 |
| 3142 | 2.04 | 1.981 |
| 3143 | 2.055 | 1.981 |
| 3144 | 2.055 | 1.981 |
| 3145 | 2.05 | 1.981 |
| 3146 | 2.05 | 1.981 |
| 3147 | 2.045 | 1.981 |
| 3148 | 2.05 | 1.981 |
| 3149 | 2.045 | 1.981 |
| 3150 | 2.035 | 1.981 |
| 3151 | 2.025 | 1.981 |
| 3152 | 2.015 | 1.981 |
| 3153 | 2.005 | 1.981 |
| 3154 | 2.005 | 1.981 |
| 3155 | 2.005 | 1.981 |
| 3156 | 2.005 | 1.981 |
| 3157 | 2.02 | 1.981 |
| 3158 | 2.035 | 1.981 |
| 3159 | 2.025 | 1.981 |
| 3160 | 2.025 | 1.981 |
| 3161 | 2.02 | 1.981 |
| 3162 | 2.015 | 1.981 |
| 3163 | 2.01 | 1.981 |
| 3164 | 2.01 | 1.981 |
| 3165 | 2.01 | 1.981 |
| 3166 | 2.01 | 1.981 |
| 3167 | 2.025 | 1.981 |
| 3168 | 2.025 | 1.981 |
| 3169 | 2.025 | 1.981 |
| 3170 | 2.015 | 1.981 |
| 3171 | 2.005 | 1.981 |
| 3172 | 1.995 | 1.981 |
| 3173 | 2.01 | 1.981 |
| 3174 | 2.01 | 1.981 |
| 3175 | 2.015 | 1.981 |
| 3176 | 2.02 | 1.981 |
| 3177 | 2.02 | 1.981 |
| 3178 | 2.015 | 1.981 |
| 3179 | 2.02 | 1.981 |
| 3180 | 2.025 | 1.981 |
| 3181 | 2.04 | 1.981 |
| 3182 | 2.055 | 1.981 |
| 3183 | 2.08 | 1.981 |
| 3184 | 2.105 | 1.981 |
| 3185 | 2.14 | 1.981 |
| 3186 | 2.135 | 1.981 |
| 3187 | 2.135 | 1.981 |
| 3188 | 2.135 | 1.981 |
| 3189 | 2.13 | 1.981 |
| 3190 | 2.135 | 1.981 |
| 3191 | 2.13 | 1.981 |
| 3192 | 2.135 | 1.981 |
| 3193 | 2.145 | 1.981 |
| 3194 | 2.145 | 1.981 |
| 3195 | 2.145 | 1.981 |
| 3196 | 2.145 | 1.981 |
| 3197 | 2.135 | 1.981 |
| 3198 | 2.12 | 1.981 |
| 3199 | 2.125 | 1.981 |
| 3200 | 2.135 | 1.981 |
| 3201 | 2.13 | 1.981 |
| 3202 | 2.135 | 1.981 |
| 3203 | 2.145 | 1.981 |
| 3204 | 2.16 | 1.981 |
| 3205 | 2.175 | 1.981 |
| 3206 | 2.2 | 1.981 |
| 3207 | 2.2 | 1.981 |
| 3208 | 2.2 | 1.981 |
| 3209 | 2.195 | 1.981 |
| 3210 | 2.19 | 1.981 |
| 3211 | 2.2 | 1.981 |
| 3212 | 2.2 | 1.981 |
| 3213 | 2.195 | 1.981 |
| 3214 | 2.19 | 1.981 |
| 3215 | 2.175 | 1.981 |
| 3216 | 2.18 | 1.981 |
| 3217 | 2.19 | 1.981 |
| 3218 | 2.19 | 1.981 |
| 3219 | 2.195 | 1.981 |
| 3220 | 2.205 | 1.981 |
| 3221 | 2.215 | 1.981 |
| 3222 | 2.225 | 1.981 |
| 3223 | 2.25 | 1.981 |
| 3224 | 2.25 | 1.981 |
| 3225 | 2.255 | 1.981 |
| 3226 | 2.255 | 1.981 |
| 3227 | 2.255 | 1.981 |
| 3228 | 2.255 | 1.981 |
| 3229 | 2.24 | 1.981 |
| 3230 | 2.24 | 1.981 |
| 3231 | 2.245 | 1.981 |
| 3232 | 2.25 | 1.981 |
| 3233 | 2.24 | 1.981 |
| 3234 | 2.24 | 1.981 |
| 3235 | 2.24 | 1.981 |
| 3236 | 2.235 | 1.981 |
| 3237 | 2.225 | 1.981 |
| 3238 | 2.23 | 1.981 |
| 3239 | 2.23 | 1.981 |
| 3240 | 2.235 | 1.981 |
| 3241 | 2.235 | 1.981 |
| 3242 | 2.235 | 1.981 |
| 3243 | 2.24 | 1.981 |
| 3244 | 2.245 | 1.981 |
| 3245 | 2.25 | 1.981 |
| 3246 | 2.235 | 1.981 |
| 3247 | 2.22 | 1.981 |
| 3248 | 2.205 | 1.981 |
| 3249 | 2.22 | 1.981 |
| 3250 | 2.24 | 1.981 |
| 3251 | 2.23 | 1.981 |